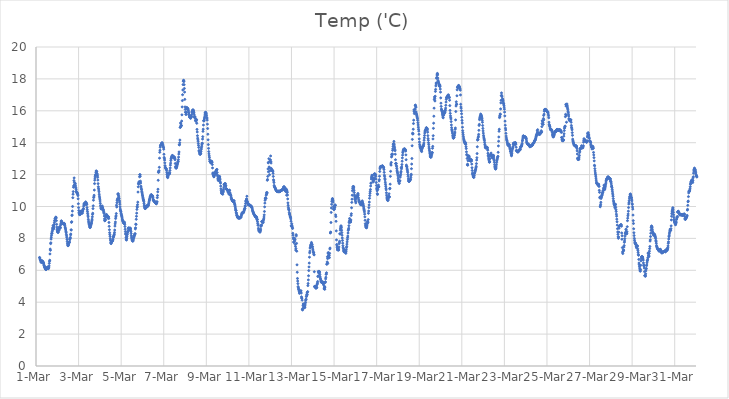
| Category | Temp ('C) |
|---|---|
| 44621.166666666664 | 6.807 |
| 44621.177083333336 | 6.78 |
| 44621.1875 | 6.709 |
| 44621.197916666664 | 6.65 |
| 44621.208333333336 | 6.647 |
| 44621.21875 | 6.585 |
| 44621.229166666664 | 6.597 |
| 44621.239583333336 | 6.498 |
| 44621.25 | 6.514 |
| 44621.260416666664 | 6.516 |
| 44621.270833333336 | 6.523 |
| 44621.28125 | 6.548 |
| 44621.291666666664 | 6.593 |
| 44621.302083333336 | 6.569 |
| 44621.3125 | 6.547 |
| 44621.322916666664 | 6.528 |
| 44621.333333333336 | 6.515 |
| 44621.34375 | 6.468 |
| 44621.354166666664 | 6.453 |
| 44621.364583333336 | 6.393 |
| 44621.375 | 6.325 |
| 44621.385416666664 | 6.295 |
| 44621.395833333336 | 6.237 |
| 44621.40625 | 6.186 |
| 44621.416666666664 | 6.149 |
| 44621.427083333336 | 6.165 |
| 44621.4375 | 6.115 |
| 44621.447916666664 | 6.073 |
| 44621.458333333336 | 6.053 |
| 44621.46875 | 6.049 |
| 44621.479166666664 | 6.056 |
| 44621.489583333336 | 6.08 |
| 44621.5 | 6.111 |
| 44621.510416666664 | 6.146 |
| 44621.520833333336 | 6.161 |
| 44621.53125 | 6.189 |
| 44621.541666666664 | 6.192 |
| 44621.552083333336 | 6.169 |
| 44621.5625 | 6.163 |
| 44621.572916666664 | 6.101 |
| 44621.583333333336 | 6.112 |
| 44621.59375 | 6.14 |
| 44621.604166666664 | 6.198 |
| 44621.614583333336 | 6.28 |
| 44621.625 | 6.437 |
| 44621.635416666664 | 6.565 |
| 44621.645833333336 | 6.632 |
| 44621.65625 | 7.025 |
| 44621.666666666664 | 7.33 |
| 44621.677083333336 | 7.256 |
| 44621.6875 | 7.672 |
| 44621.697916666664 | 7.723 |
| 44621.708333333336 | 7.956 |
| 44621.71875 | 8.076 |
| 44621.729166666664 | 8.202 |
| 44621.739583333336 | 8.321 |
| 44621.75 | 8.321 |
| 44621.760416666664 | 8.419 |
| 44621.770833333336 | 8.521 |
| 44621.78125 | 8.627 |
| 44621.791666666664 | 8.689 |
| 44621.802083333336 | 8.806 |
| 44621.8125 | 8.647 |
| 44621.822916666664 | 8.586 |
| 44621.833333333336 | 8.64 |
| 44621.84375 | 8.767 |
| 44621.854166666664 | 8.87 |
| 44621.864583333336 | 8.992 |
| 44621.875 | 9.104 |
| 44621.885416666664 | 9.142 |
| 44621.895833333336 | 9.23 |
| 44621.90625 | 9.242 |
| 44621.916666666664 | 9.272 |
| 44621.927083333336 | 9.323 |
| 44621.9375 | 9.332 |
| 44621.947916666664 | 9.275 |
| 44621.958333333336 | 9.113 |
| 44621.96875 | 8.882 |
| 44621.979166666664 | 8.705 |
| 44621.989583333336 | 8.572 |
| 44622.0 | 8.477 |
| 44622.010416666664 | 8.424 |
| 44622.020833333336 | 8.402 |
| 44622.03125 | 8.384 |
| 44622.041666666664 | 8.375 |
| 44622.052083333336 | 8.604 |
| 44622.0625 | 8.505 |
| 44622.072916666664 | 8.487 |
| 44622.083333333336 | 8.544 |
| 44622.09375 | 8.65 |
| 44622.104166666664 | 8.723 |
| 44622.114583333336 | 8.697 |
| 44622.125 | 8.65 |
| 44622.135416666664 | 8.646 |
| 44622.145833333336 | 8.691 |
| 44622.15625 | 8.838 |
| 44622.166666666664 | 8.916 |
| 44622.177083333336 | 9.032 |
| 44622.1875 | 9.097 |
| 44622.197916666664 | 9.084 |
| 44622.208333333336 | 9.008 |
| 44622.21875 | 8.981 |
| 44622.229166666664 | 8.961 |
| 44622.239583333336 | 8.956 |
| 44622.25 | 8.935 |
| 44622.260416666664 | 8.958 |
| 44622.270833333336 | 8.915 |
| 44622.28125 | 8.938 |
| 44622.291666666664 | 8.941 |
| 44622.302083333336 | 8.92 |
| 44622.3125 | 8.888 |
| 44622.322916666664 | 8.947 |
| 44622.333333333336 | 8.917 |
| 44622.34375 | 8.891 |
| 44622.354166666664 | 8.824 |
| 44622.364583333336 | 8.717 |
| 44622.375 | 8.661 |
| 44622.385416666664 | 8.6 |
| 44622.395833333336 | 8.526 |
| 44622.40625 | 8.432 |
| 44622.416666666664 | 8.358 |
| 44622.427083333336 | 8.247 |
| 44622.4375 | 8.158 |
| 44622.447916666664 | 8.06 |
| 44622.458333333336 | 7.93 |
| 44622.46875 | 7.797 |
| 44622.479166666664 | 7.685 |
| 44622.489583333336 | 7.602 |
| 44622.5 | 7.541 |
| 44622.510416666664 | 7.545 |
| 44622.520833333336 | 7.576 |
| 44622.53125 | 7.641 |
| 44622.541666666664 | 7.694 |
| 44622.552083333336 | 7.737 |
| 44622.5625 | 7.753 |
| 44622.572916666664 | 7.775 |
| 44622.583333333336 | 7.912 |
| 44622.59375 | 7.995 |
| 44622.604166666664 | 7.984 |
| 44622.614583333336 | 8.063 |
| 44622.625 | 8.224 |
| 44622.635416666664 | 8.275 |
| 44622.645833333336 | 8.535 |
| 44622.65625 | 8.528 |
| 44622.666666666664 | 9.005 |
| 44622.677083333336 | 9.045 |
| 44622.6875 | 9.436 |
| 44622.697916666664 | 9.468 |
| 44622.708333333336 | 9.714 |
| 44622.71875 | 10.002 |
| 44622.729166666664 | 10.552 |
| 44622.739583333336 | 10.769 |
| 44622.75 | 10.932 |
| 44622.760416666664 | 11.207 |
| 44622.770833333336 | 11.297 |
| 44622.78125 | 11.624 |
| 44622.791666666664 | 11.791 |
| 44622.802083333336 | 11.515 |
| 44622.8125 | 11.356 |
| 44622.822916666664 | 11.373 |
| 44622.833333333336 | 11.468 |
| 44622.84375 | 11.427 |
| 44622.854166666664 | 11.294 |
| 44622.864583333336 | 11.191 |
| 44622.875 | 11.154 |
| 44622.885416666664 | 11.063 |
| 44622.895833333336 | 10.95 |
| 44622.90625 | 10.895 |
| 44622.916666666664 | 10.859 |
| 44622.927083333336 | 10.867 |
| 44622.9375 | 10.849 |
| 44622.947916666664 | 10.802 |
| 44622.958333333336 | 10.758 |
| 44622.96875 | 10.684 |
| 44622.979166666664 | 10.482 |
| 44622.989583333336 | 10.172 |
| 44623.0 | 9.927 |
| 44623.010416666664 | 9.746 |
| 44623.020833333336 | 9.618 |
| 44623.03125 | 9.549 |
| 44623.041666666664 | 9.49 |
| 44623.052083333336 | 9.502 |
| 44623.0625 | 9.507 |
| 44623.072916666664 | 9.498 |
| 44623.083333333336 | 9.68 |
| 44623.09375 | 9.692 |
| 44623.104166666664 | 9.699 |
| 44623.114583333336 | 9.642 |
| 44623.125 | 9.564 |
| 44623.135416666664 | 9.684 |
| 44623.145833333336 | 9.726 |
| 44623.15625 | 9.618 |
| 44623.166666666664 | 9.646 |
| 44623.177083333336 | 9.575 |
| 44623.1875 | 9.722 |
| 44623.197916666664 | 9.716 |
| 44623.208333333336 | 9.808 |
| 44623.21875 | 9.845 |
| 44623.229166666664 | 9.876 |
| 44623.239583333336 | 10.022 |
| 44623.25 | 10.102 |
| 44623.260416666664 | 10.168 |
| 44623.270833333336 | 10.177 |
| 44623.28125 | 10.211 |
| 44623.291666666664 | 10.182 |
| 44623.302083333336 | 10.122 |
| 44623.3125 | 10.191 |
| 44623.322916666664 | 10.201 |
| 44623.333333333336 | 10.292 |
| 44623.34375 | 10.197 |
| 44623.354166666664 | 10.134 |
| 44623.364583333336 | 10.219 |
| 44623.375 | 10.197 |
| 44623.385416666664 | 10.121 |
| 44623.395833333336 | 9.934 |
| 44623.40625 | 9.805 |
| 44623.416666666664 | 9.688 |
| 44623.427083333336 | 9.569 |
| 44623.4375 | 9.461 |
| 44623.447916666664 | 9.357 |
| 44623.458333333336 | 9.198 |
| 44623.46875 | 9.084 |
| 44623.479166666664 | 8.989 |
| 44623.489583333336 | 8.919 |
| 44623.5 | 8.884 |
| 44623.510416666664 | 8.81 |
| 44623.520833333336 | 8.742 |
| 44623.53125 | 8.695 |
| 44623.541666666664 | 8.678 |
| 44623.552083333336 | 8.714 |
| 44623.5625 | 8.773 |
| 44623.572916666664 | 8.821 |
| 44623.583333333336 | 8.882 |
| 44623.59375 | 8.92 |
| 44623.604166666664 | 8.96 |
| 44623.614583333336 | 9.039 |
| 44623.625 | 9.126 |
| 44623.635416666664 | 9.205 |
| 44623.645833333336 | 9.351 |
| 44623.65625 | 9.504 |
| 44623.666666666664 | 9.578 |
| 44623.677083333336 | 9.868 |
| 44623.6875 | 10.043 |
| 44623.697916666664 | 10.396 |
| 44623.708333333336 | 10.561 |
| 44623.71875 | 10.604 |
| 44623.729166666664 | 10.705 |
| 44623.739583333336 | 11.03 |
| 44623.75 | 11.435 |
| 44623.760416666664 | 11.65 |
| 44623.770833333336 | 11.777 |
| 44623.78125 | 11.89 |
| 44623.791666666664 | 11.964 |
| 44623.802083333336 | 11.986 |
| 44623.8125 | 12.113 |
| 44623.822916666664 | 12.224 |
| 44623.833333333336 | 12.222 |
| 44623.84375 | 12.194 |
| 44623.854166666664 | 12.179 |
| 44623.864583333336 | 12.062 |
| 44623.875 | 12.022 |
| 44623.885416666664 | 11.926 |
| 44623.895833333336 | 11.831 |
| 44623.90625 | 11.659 |
| 44623.916666666664 | 11.433 |
| 44623.927083333336 | 11.241 |
| 44623.9375 | 11.135 |
| 44623.947916666664 | 11.034 |
| 44623.958333333336 | 10.923 |
| 44623.96875 | 10.772 |
| 44623.979166666664 | 10.648 |
| 44623.989583333336 | 10.543 |
| 44624.0 | 10.458 |
| 44624.010416666664 | 10.343 |
| 44624.020833333336 | 10.199 |
| 44624.03125 | 10.064 |
| 44624.041666666664 | 9.973 |
| 44624.052083333336 | 9.885 |
| 44624.0625 | 9.847 |
| 44624.072916666664 | 9.85 |
| 44624.083333333336 | 9.875 |
| 44624.09375 | 9.927 |
| 44624.104166666664 | 9.961 |
| 44624.114583333336 | 10.03 |
| 44624.125 | 9.939 |
| 44624.135416666664 | 9.901 |
| 44624.145833333336 | 9.834 |
| 44624.15625 | 9.798 |
| 44624.166666666664 | 9.762 |
| 44624.177083333336 | 9.677 |
| 44624.1875 | 9.617 |
| 44624.197916666664 | 9.559 |
| 44624.208333333336 | 9.4 |
| 44624.21875 | 9.224 |
| 44624.229166666664 | 9.107 |
| 44624.239583333336 | 9.124 |
| 44624.25 | 9.153 |
| 44624.260416666664 | 9.183 |
| 44624.270833333336 | 9.347 |
| 44624.28125 | 9.469 |
| 44624.291666666664 | 9.38 |
| 44624.302083333336 | 9.458 |
| 44624.3125 | 9.5 |
| 44624.322916666664 | 9.43 |
| 44624.333333333336 | 9.457 |
| 44624.34375 | 9.338 |
| 44624.354166666664 | 9.363 |
| 44624.364583333336 | 9.381 |
| 44624.375 | 9.272 |
| 44624.385416666664 | 9.323 |
| 44624.395833333336 | 9.35 |
| 44624.40625 | 9.355 |
| 44624.416666666664 | 9.248 |
| 44624.427083333336 | 8.999 |
| 44624.4375 | 8.757 |
| 44624.447916666664 | 8.543 |
| 44624.458333333336 | 8.358 |
| 44624.46875 | 8.236 |
| 44624.479166666664 | 8.121 |
| 44624.489583333336 | 7.974 |
| 44624.5 | 7.873 |
| 44624.510416666664 | 7.753 |
| 44624.520833333336 | 7.684 |
| 44624.53125 | 7.678 |
| 44624.541666666664 | 7.765 |
| 44624.552083333336 | 7.791 |
| 44624.5625 | 7.798 |
| 44624.572916666664 | 7.811 |
| 44624.583333333336 | 7.826 |
| 44624.59375 | 7.858 |
| 44624.604166666664 | 7.889 |
| 44624.614583333336 | 7.944 |
| 44624.625 | 8.091 |
| 44624.635416666664 | 8.061 |
| 44624.645833333336 | 8.132 |
| 44624.65625 | 8.171 |
| 44624.666666666664 | 8.223 |
| 44624.677083333336 | 8.272 |
| 44624.6875 | 8.376 |
| 44624.697916666664 | 8.523 |
| 44624.708333333336 | 8.773 |
| 44624.71875 | 8.91 |
| 44624.729166666664 | 9.027 |
| 44624.739583333336 | 9.246 |
| 44624.75 | 9.349 |
| 44624.760416666664 | 9.415 |
| 44624.770833333336 | 9.556 |
| 44624.78125 | 10.083 |
| 44624.791666666664 | 9.97 |
| 44624.802083333336 | 10.237 |
| 44624.8125 | 10.374 |
| 44624.822916666664 | 10.433 |
| 44624.833333333336 | 10.499 |
| 44624.84375 | 10.776 |
| 44624.854166666664 | 10.784 |
| 44624.864583333336 | 10.795 |
| 44624.875 | 10.699 |
| 44624.885416666664 | 10.623 |
| 44624.895833333336 | 10.531 |
| 44624.90625 | 10.483 |
| 44624.916666666664 | 10.368 |
| 44624.927083333336 | 10.278 |
| 44624.9375 | 10.143 |
| 44624.947916666664 | 9.983 |
| 44624.958333333336 | 9.837 |
| 44624.96875 | 9.759 |
| 44624.979166666664 | 9.702 |
| 44624.989583333336 | 9.659 |
| 44625.0 | 9.558 |
| 44625.010416666664 | 9.494 |
| 44625.020833333336 | 9.432 |
| 44625.03125 | 9.384 |
| 44625.041666666664 | 9.292 |
| 44625.052083333336 | 9.21 |
| 44625.0625 | 9.149 |
| 44625.072916666664 | 9.105 |
| 44625.083333333336 | 9.074 |
| 44625.09375 | 9.041 |
| 44625.104166666664 | 8.995 |
| 44625.114583333336 | 8.977 |
| 44625.125 | 8.952 |
| 44625.135416666664 | 8.947 |
| 44625.145833333336 | 8.961 |
| 44625.15625 | 9.018 |
| 44625.166666666664 | 8.883 |
| 44625.177083333336 | 8.744 |
| 44625.1875 | 8.573 |
| 44625.197916666664 | 8.425 |
| 44625.208333333336 | 8.29 |
| 44625.21875 | 8.245 |
| 44625.229166666664 | 8.066 |
| 44625.239583333336 | 7.928 |
| 44625.25 | 7.895 |
| 44625.260416666664 | 7.997 |
| 44625.270833333336 | 8.11 |
| 44625.28125 | 8.226 |
| 44625.291666666664 | 8.279 |
| 44625.302083333336 | 8.386 |
| 44625.3125 | 8.417 |
| 44625.322916666664 | 8.484 |
| 44625.333333333336 | 8.62 |
| 44625.34375 | 8.661 |
| 44625.354166666664 | 8.632 |
| 44625.364583333336 | 8.599 |
| 44625.375 | 8.647 |
| 44625.385416666664 | 8.633 |
| 44625.395833333336 | 8.623 |
| 44625.40625 | 8.529 |
| 44625.416666666664 | 8.625 |
| 44625.427083333336 | 8.648 |
| 44625.4375 | 8.62 |
| 44625.447916666664 | 8.52 |
| 44625.458333333336 | 8.42 |
| 44625.46875 | 8.303 |
| 44625.479166666664 | 8.17 |
| 44625.489583333336 | 8.076 |
| 44625.5 | 7.997 |
| 44625.510416666664 | 7.927 |
| 44625.520833333336 | 7.88 |
| 44625.53125 | 7.854 |
| 44625.541666666664 | 7.834 |
| 44625.552083333336 | 7.829 |
| 44625.5625 | 7.862 |
| 44625.572916666664 | 7.946 |
| 44625.583333333336 | 8.014 |
| 44625.59375 | 8.059 |
| 44625.604166666664 | 8.112 |
| 44625.614583333336 | 8.158 |
| 44625.625 | 8.198 |
| 44625.635416666664 | 8.256 |
| 44625.645833333336 | 8.276 |
| 44625.65625 | 8.299 |
| 44625.666666666664 | 8.595 |
| 44625.677083333336 | 8.665 |
| 44625.6875 | 8.894 |
| 44625.697916666664 | 8.877 |
| 44625.708333333336 | 9.197 |
| 44625.71875 | 9.387 |
| 44625.729166666664 | 9.583 |
| 44625.739583333336 | 9.818 |
| 44625.75 | 10.002 |
| 44625.760416666664 | 9.953 |
| 44625.770833333336 | 10.116 |
| 44625.78125 | 10.274 |
| 44625.791666666664 | 10.906 |
| 44625.802083333336 | 11.233 |
| 44625.8125 | 11.442 |
| 44625.822916666664 | 11.4 |
| 44625.833333333336 | 11.503 |
| 44625.84375 | 11.558 |
| 44625.854166666664 | 11.522 |
| 44625.864583333336 | 11.861 |
| 44625.875 | 11.993 |
| 44625.885416666664 | 11.998 |
| 44625.895833333336 | 11.899 |
| 44625.90625 | 11.587 |
| 44625.916666666664 | 11.472 |
| 44625.927083333336 | 11.28 |
| 44625.9375 | 11.215 |
| 44625.947916666664 | 11.109 |
| 44625.958333333336 | 11.054 |
| 44625.96875 | 10.946 |
| 44625.979166666664 | 10.869 |
| 44625.989583333336 | 10.788 |
| 44626.0 | 10.713 |
| 44626.010416666664 | 10.65 |
| 44626.020833333336 | 10.563 |
| 44626.03125 | 10.491 |
| 44626.041666666664 | 10.427 |
| 44626.052083333336 | 10.388 |
| 44626.0625 | 10.322 |
| 44626.072916666664 | 10.201 |
| 44626.083333333336 | 10.088 |
| 44626.09375 | 10.01 |
| 44626.104166666664 | 9.945 |
| 44626.114583333336 | 9.904 |
| 44626.125 | 9.871 |
| 44626.135416666664 | 9.879 |
| 44626.145833333336 | 9.892 |
| 44626.15625 | 9.914 |
| 44626.166666666664 | 9.92 |
| 44626.177083333336 | 9.941 |
| 44626.1875 | 10.028 |
| 44626.197916666664 | 10.044 |
| 44626.208333333336 | 10.026 |
| 44626.21875 | 9.993 |
| 44626.229166666664 | 9.996 |
| 44626.239583333336 | 10.031 |
| 44626.25 | 10.03 |
| 44626.260416666664 | 10.03 |
| 44626.270833333336 | 10.066 |
| 44626.28125 | 10.091 |
| 44626.291666666664 | 10.171 |
| 44626.302083333336 | 10.231 |
| 44626.3125 | 10.33 |
| 44626.322916666664 | 10.405 |
| 44626.333333333336 | 10.413 |
| 44626.34375 | 10.499 |
| 44626.354166666664 | 10.545 |
| 44626.364583333336 | 10.609 |
| 44626.375 | 10.617 |
| 44626.385416666664 | 10.678 |
| 44626.395833333336 | 10.709 |
| 44626.40625 | 10.734 |
| 44626.416666666664 | 10.731 |
| 44626.427083333336 | 10.731 |
| 44626.4375 | 10.696 |
| 44626.447916666664 | 10.696 |
| 44626.458333333336 | 10.683 |
| 44626.46875 | 10.657 |
| 44626.479166666664 | 10.624 |
| 44626.489583333336 | 10.565 |
| 44626.5 | 10.466 |
| 44626.510416666664 | 10.391 |
| 44626.520833333336 | 10.379 |
| 44626.53125 | 10.378 |
| 44626.541666666664 | 10.348 |
| 44626.552083333336 | 10.321 |
| 44626.5625 | 10.314 |
| 44626.572916666664 | 10.291 |
| 44626.583333333336 | 10.277 |
| 44626.59375 | 10.268 |
| 44626.604166666664 | 10.262 |
| 44626.614583333336 | 10.242 |
| 44626.625 | 10.216 |
| 44626.635416666664 | 10.192 |
| 44626.645833333336 | 10.171 |
| 44626.65625 | 10.176 |
| 44626.666666666664 | 10.205 |
| 44626.677083333336 | 10.301 |
| 44626.6875 | 10.284 |
| 44626.697916666664 | 10.553 |
| 44626.708333333336 | 10.689 |
| 44626.71875 | 10.918 |
| 44626.729166666664 | 11.084 |
| 44626.739583333336 | 11.644 |
| 44626.75 | 12.141 |
| 44626.760416666664 | 12.205 |
| 44626.770833333336 | 12.153 |
| 44626.78125 | 12.245 |
| 44626.791666666664 | 12.456 |
| 44626.802083333336 | 13.031 |
| 44626.8125 | 13.397 |
| 44626.822916666664 | 13.529 |
| 44626.833333333336 | 13.716 |
| 44626.84375 | 13.804 |
| 44626.854166666664 | 13.841 |
| 44626.864583333336 | 13.84 |
| 44626.875 | 13.875 |
| 44626.885416666664 | 13.9 |
| 44626.895833333336 | 13.947 |
| 44626.90625 | 13.972 |
| 44626.916666666664 | 13.986 |
| 44626.927083333336 | 13.997 |
| 44626.9375 | 13.929 |
| 44626.947916666664 | 13.88 |
| 44626.958333333336 | 13.855 |
| 44626.96875 | 13.797 |
| 44626.979166666664 | 13.732 |
| 44626.989583333336 | 13.696 |
| 44627.0 | 13.594 |
| 44627.010416666664 | 13.274 |
| 44627.020833333336 | 13.076 |
| 44627.03125 | 13.003 |
| 44627.041666666664 | 12.91 |
| 44627.052083333336 | 12.735 |
| 44627.0625 | 12.563 |
| 44627.072916666664 | 12.467 |
| 44627.083333333336 | 12.43 |
| 44627.09375 | 12.397 |
| 44627.104166666664 | 12.355 |
| 44627.114583333336 | 12.365 |
| 44627.125 | 12.337 |
| 44627.135416666664 | 12.247 |
| 44627.145833333336 | 12.119 |
| 44627.15625 | 12.005 |
| 44627.166666666664 | 11.901 |
| 44627.177083333336 | 11.845 |
| 44627.1875 | 11.808 |
| 44627.197916666664 | 11.87 |
| 44627.208333333336 | 12.009 |
| 44627.21875 | 12.005 |
| 44627.229166666664 | 12.11 |
| 44627.239583333336 | 12.077 |
| 44627.25 | 12.082 |
| 44627.260416666664 | 12.025 |
| 44627.270833333336 | 12.062 |
| 44627.28125 | 12.117 |
| 44627.291666666664 | 12.26 |
| 44627.302083333336 | 12.419 |
| 44627.3125 | 12.595 |
| 44627.322916666664 | 12.721 |
| 44627.333333333336 | 12.882 |
| 44627.34375 | 12.982 |
| 44627.354166666664 | 13.025 |
| 44627.364583333336 | 13.088 |
| 44627.375 | 13.104 |
| 44627.385416666664 | 13.151 |
| 44627.395833333336 | 13.177 |
| 44627.40625 | 13.201 |
| 44627.416666666664 | 13.188 |
| 44627.427083333336 | 13.158 |
| 44627.4375 | 13.144 |
| 44627.447916666664 | 13.126 |
| 44627.458333333336 | 13.103 |
| 44627.46875 | 13.048 |
| 44627.479166666664 | 13.093 |
| 44627.489583333336 | 13.109 |
| 44627.5 | 13.092 |
| 44627.510416666664 | 13.058 |
| 44627.520833333336 | 13.012 |
| 44627.53125 | 12.928 |
| 44627.541666666664 | 12.695 |
| 44627.552083333336 | 12.503 |
| 44627.5625 | 12.442 |
| 44627.572916666664 | 12.41 |
| 44627.583333333336 | 12.413 |
| 44627.59375 | 12.418 |
| 44627.604166666664 | 12.472 |
| 44627.614583333336 | 12.518 |
| 44627.625 | 12.584 |
| 44627.635416666664 | 12.638 |
| 44627.645833333336 | 12.691 |
| 44627.65625 | 12.752 |
| 44627.666666666664 | 12.807 |
| 44627.677083333336 | 12.836 |
| 44627.6875 | 12.941 |
| 44627.697916666664 | 13.098 |
| 44627.708333333336 | 13.288 |
| 44627.71875 | 13.419 |
| 44627.729166666664 | 13.872 |
| 44627.739583333336 | 13.871 |
| 44627.75 | 13.994 |
| 44627.760416666664 | 14.166 |
| 44627.770833333336 | 14.962 |
| 44627.78125 | 14.964 |
| 44627.791666666664 | 15.243 |
| 44627.802083333336 | 15.185 |
| 44627.8125 | 15.073 |
| 44627.822916666664 | 15.059 |
| 44627.833333333336 | 15.079 |
| 44627.84375 | 15.356 |
| 44627.854166666664 | 15.748 |
| 44627.864583333336 | 16.242 |
| 44627.875 | 16.64 |
| 44627.885416666664 | 17.007 |
| 44627.895833333336 | 17.305 |
| 44627.90625 | 17.643 |
| 44627.916666666664 | 17.856 |
| 44627.927083333336 | 17.91 |
| 44627.9375 | 17.902 |
| 44627.947916666664 | 17.834 |
| 44627.958333333336 | 17.637 |
| 44627.96875 | 17.4 |
| 44627.979166666664 | 17.173 |
| 44627.989583333336 | 16.716 |
| 44628.0 | 16.243 |
| 44628.010416666664 | 16.088 |
| 44628.020833333336 | 15.916 |
| 44628.03125 | 15.894 |
| 44628.041666666664 | 15.776 |
| 44628.052083333336 | 15.776 |
| 44628.0625 | 15.914 |
| 44628.072916666664 | 16.169 |
| 44628.083333333336 | 16.215 |
| 44628.09375 | 16.12 |
| 44628.104166666664 | 16.12 |
| 44628.114583333336 | 16.143 |
| 44628.125 | 16.159 |
| 44628.135416666664 | 16.126 |
| 44628.145833333336 | 16.079 |
| 44628.15625 | 16.012 |
| 44628.166666666664 | 15.917 |
| 44628.177083333336 | 15.859 |
| 44628.1875 | 15.778 |
| 44628.197916666664 | 15.698 |
| 44628.208333333336 | 15.615 |
| 44628.21875 | 15.592 |
| 44628.229166666664 | 15.682 |
| 44628.239583333336 | 15.636 |
| 44628.25 | 15.575 |
| 44628.260416666664 | 15.526 |
| 44628.270833333336 | 15.603 |
| 44628.28125 | 15.623 |
| 44628.291666666664 | 15.632 |
| 44628.302083333336 | 15.617 |
| 44628.3125 | 15.751 |
| 44628.322916666664 | 15.937 |
| 44628.333333333336 | 15.884 |
| 44628.34375 | 15.93 |
| 44628.354166666664 | 16.048 |
| 44628.364583333336 | 16.025 |
| 44628.375 | 16.047 |
| 44628.385416666664 | 16.052 |
| 44628.395833333336 | 15.925 |
| 44628.40625 | 15.98 |
| 44628.416666666664 | 15.884 |
| 44628.427083333336 | 15.776 |
| 44628.4375 | 15.649 |
| 44628.447916666664 | 15.587 |
| 44628.458333333336 | 15.59 |
| 44628.46875 | 15.626 |
| 44628.479166666664 | 15.528 |
| 44628.489583333336 | 15.403 |
| 44628.5 | 15.391 |
| 44628.510416666664 | 15.338 |
| 44628.520833333336 | 15.392 |
| 44628.53125 | 15.424 |
| 44628.541666666664 | 15.449 |
| 44628.552083333336 | 15.217 |
| 44628.5625 | 14.835 |
| 44628.572916666664 | 14.673 |
| 44628.583333333336 | 14.44 |
| 44628.59375 | 14.283 |
| 44628.604166666664 | 14.18 |
| 44628.614583333336 | 14.089 |
| 44628.625 | 13.948 |
| 44628.635416666664 | 13.829 |
| 44628.645833333336 | 13.7 |
| 44628.65625 | 13.508 |
| 44628.666666666664 | 13.447 |
| 44628.677083333336 | 13.413 |
| 44628.6875 | 13.324 |
| 44628.697916666664 | 13.284 |
| 44628.708333333336 | 13.277 |
| 44628.71875 | 13.275 |
| 44628.729166666664 | 13.318 |
| 44628.739583333336 | 13.34 |
| 44628.75 | 13.462 |
| 44628.760416666664 | 13.588 |
| 44628.770833333336 | 13.677 |
| 44628.78125 | 13.767 |
| 44628.791666666664 | 13.871 |
| 44628.802083333336 | 13.96 |
| 44628.8125 | 13.968 |
| 44628.822916666664 | 14.227 |
| 44628.833333333336 | 14.379 |
| 44628.84375 | 14.711 |
| 44628.854166666664 | 14.848 |
| 44628.864583333336 | 15.106 |
| 44628.875 | 15.386 |
| 44628.885416666664 | 15.356 |
| 44628.895833333336 | 15.399 |
| 44628.90625 | 15.483 |
| 44628.916666666664 | 15.564 |
| 44628.927083333336 | 15.666 |
| 44628.9375 | 15.792 |
| 44628.947916666664 | 15.881 |
| 44628.958333333336 | 15.905 |
| 44628.96875 | 15.869 |
| 44628.979166666664 | 15.893 |
| 44628.989583333336 | 15.844 |
| 44629.0 | 15.791 |
| 44629.010416666664 | 15.691 |
| 44629.020833333336 | 15.571 |
| 44629.03125 | 15.536 |
| 44629.041666666664 | 15.417 |
| 44629.052083333336 | 15.162 |
| 44629.0625 | 14.889 |
| 44629.072916666664 | 14.532 |
| 44629.083333333336 | 14.18 |
| 44629.09375 | 13.882 |
| 44629.104166666664 | 13.644 |
| 44629.114583333336 | 13.442 |
| 44629.125 | 13.3 |
| 44629.135416666664 | 13.173 |
| 44629.145833333336 | 13.067 |
| 44629.15625 | 12.936 |
| 44629.166666666664 | 12.831 |
| 44629.177083333336 | 12.831 |
| 44629.1875 | 12.794 |
| 44629.197916666664 | 12.762 |
| 44629.208333333336 | 12.74 |
| 44629.21875 | 12.746 |
| 44629.229166666664 | 12.764 |
| 44629.239583333336 | 12.826 |
| 44629.25 | 12.838 |
| 44629.260416666664 | 12.767 |
| 44629.270833333336 | 12.786 |
| 44629.28125 | 12.629 |
| 44629.291666666664 | 12.417 |
| 44629.302083333336 | 12.088 |
| 44629.3125 | 11.991 |
| 44629.322916666664 | 12.107 |
| 44629.333333333336 | 11.993 |
| 44629.34375 | 11.916 |
| 44629.354166666664 | 11.86 |
| 44629.364583333336 | 11.874 |
| 44629.375 | 11.956 |
| 44629.385416666664 | 11.985 |
| 44629.395833333336 | 12.027 |
| 44629.40625 | 12.102 |
| 44629.416666666664 | 12.114 |
| 44629.427083333336 | 12.194 |
| 44629.4375 | 12.088 |
| 44629.447916666664 | 12.053 |
| 44629.458333333336 | 12.223 |
| 44629.46875 | 12.289 |
| 44629.479166666664 | 12.274 |
| 44629.489583333336 | 12.295 |
| 44629.5 | 12.327 |
| 44629.510416666664 | 12.129 |
| 44629.520833333336 | 11.975 |
| 44629.53125 | 11.91 |
| 44629.541666666664 | 11.775 |
| 44629.552083333336 | 11.704 |
| 44629.5625 | 11.637 |
| 44629.572916666664 | 11.624 |
| 44629.583333333336 | 11.75 |
| 44629.59375 | 11.795 |
| 44629.604166666664 | 11.832 |
| 44629.614583333336 | 11.869 |
| 44629.625 | 11.885 |
| 44629.635416666664 | 11.772 |
| 44629.645833333336 | 11.674 |
| 44629.65625 | 11.537 |
| 44629.666666666664 | 11.466 |
| 44629.677083333336 | 11.28 |
| 44629.6875 | 11.107 |
| 44629.697916666664 | 10.989 |
| 44629.708333333336 | 10.904 |
| 44629.71875 | 10.826 |
| 44629.729166666664 | 10.816 |
| 44629.739583333336 | 10.809 |
| 44629.75 | 10.872 |
| 44629.760416666664 | 10.831 |
| 44629.770833333336 | 10.768 |
| 44629.78125 | 10.97 |
| 44629.791666666664 | 11 |
| 44629.802083333336 | 10.914 |
| 44629.8125 | 11.083 |
| 44629.822916666664 | 11.211 |
| 44629.833333333336 | 11.361 |
| 44629.84375 | 11.383 |
| 44629.854166666664 | 11.411 |
| 44629.864583333336 | 11.415 |
| 44629.875 | 11.425 |
| 44629.885416666664 | 11.391 |
| 44629.895833333336 | 11.439 |
| 44629.90625 | 11.272 |
| 44629.916666666664 | 11.304 |
| 44629.927083333336 | 11.12 |
| 44629.9375 | 11.118 |
| 44629.947916666664 | 11.1 |
| 44629.958333333336 | 11.076 |
| 44629.96875 | 11.078 |
| 44629.979166666664 | 11.028 |
| 44629.989583333336 | 11.029 |
| 44630.0 | 11.024 |
| 44630.010416666664 | 10.977 |
| 44630.020833333336 | 10.9 |
| 44630.03125 | 10.938 |
| 44630.041666666664 | 10.877 |
| 44630.052083333336 | 10.854 |
| 44630.0625 | 10.773 |
| 44630.072916666664 | 11.008 |
| 44630.083333333336 | 11.026 |
| 44630.09375 | 11.005 |
| 44630.104166666664 | 10.872 |
| 44630.114583333336 | 10.818 |
| 44630.125 | 10.756 |
| 44630.135416666664 | 10.73 |
| 44630.145833333336 | 10.706 |
| 44630.15625 | 10.66 |
| 44630.166666666664 | 10.58 |
| 44630.177083333336 | 10.511 |
| 44630.1875 | 10.463 |
| 44630.197916666664 | 10.439 |
| 44630.208333333336 | 10.411 |
| 44630.21875 | 10.379 |
| 44630.229166666664 | 10.354 |
| 44630.239583333336 | 10.341 |
| 44630.25 | 10.33 |
| 44630.260416666664 | 10.31 |
| 44630.270833333336 | 10.318 |
| 44630.28125 | 10.332 |
| 44630.291666666664 | 10.368 |
| 44630.302083333336 | 10.358 |
| 44630.3125 | 10.275 |
| 44630.322916666664 | 10.195 |
| 44630.333333333336 | 10.136 |
| 44630.34375 | 10.084 |
| 44630.354166666664 | 10.007 |
| 44630.364583333336 | 9.909 |
| 44630.375 | 9.828 |
| 44630.385416666664 | 9.74 |
| 44630.395833333336 | 9.752 |
| 44630.40625 | 9.616 |
| 44630.416666666664 | 9.573 |
| 44630.427083333336 | 9.476 |
| 44630.4375 | 9.427 |
| 44630.447916666664 | 9.431 |
| 44630.458333333336 | 9.376 |
| 44630.46875 | 9.325 |
| 44630.479166666664 | 9.318 |
| 44630.489583333336 | 9.276 |
| 44630.5 | 9.29 |
| 44630.510416666664 | 9.307 |
| 44630.520833333336 | 9.283 |
| 44630.53125 | 9.267 |
| 44630.541666666664 | 9.303 |
| 44630.552083333336 | 9.299 |
| 44630.5625 | 9.281 |
| 44630.572916666664 | 9.273 |
| 44630.583333333336 | 9.278 |
| 44630.59375 | 9.304 |
| 44630.604166666664 | 9.319 |
| 44630.614583333336 | 9.33 |
| 44630.625 | 9.333 |
| 44630.635416666664 | 9.354 |
| 44630.645833333336 | 9.434 |
| 44630.65625 | 9.489 |
| 44630.666666666664 | 9.537 |
| 44630.677083333336 | 9.574 |
| 44630.6875 | 9.612 |
| 44630.697916666664 | 9.616 |
| 44630.708333333336 | 9.594 |
| 44630.71875 | 9.603 |
| 44630.729166666664 | 9.603 |
| 44630.739583333336 | 9.617 |
| 44630.75 | 9.644 |
| 44630.760416666664 | 9.663 |
| 44630.770833333336 | 9.725 |
| 44630.78125 | 9.782 |
| 44630.791666666664 | 9.813 |
| 44630.802083333336 | 9.889 |
| 44630.8125 | 9.882 |
| 44630.822916666664 | 10.038 |
| 44630.833333333336 | 10.019 |
| 44630.84375 | 10.189 |
| 44630.854166666664 | 10.317 |
| 44630.864583333336 | 10.369 |
| 44630.875 | 10.391 |
| 44630.885416666664 | 10.467 |
| 44630.895833333336 | 10.46 |
| 44630.90625 | 10.643 |
| 44630.916666666664 | 10.332 |
| 44630.927083333336 | 10.315 |
| 44630.9375 | 10.259 |
| 44630.947916666664 | 10.204 |
| 44630.958333333336 | 10.146 |
| 44630.96875 | 10.124 |
| 44630.979166666664 | 10.113 |
| 44630.989583333336 | 10.131 |
| 44631.0 | 10.106 |
| 44631.010416666664 | 10.088 |
| 44631.020833333336 | 10.093 |
| 44631.03125 | 10.081 |
| 44631.041666666664 | 10.085 |
| 44631.052083333336 | 10.085 |
| 44631.0625 | 10.068 |
| 44631.072916666664 | 10.052 |
| 44631.083333333336 | 10.055 |
| 44631.09375 | 9.996 |
| 44631.104166666664 | 9.986 |
| 44631.114583333336 | 10.008 |
| 44631.125 | 9.997 |
| 44631.135416666664 | 9.961 |
| 44631.145833333336 | 9.923 |
| 44631.15625 | 9.855 |
| 44631.166666666664 | 9.775 |
| 44631.177083333336 | 9.725 |
| 44631.1875 | 9.689 |
| 44631.197916666664 | 9.653 |
| 44631.208333333336 | 9.615 |
| 44631.21875 | 9.579 |
| 44631.229166666664 | 9.538 |
| 44631.239583333336 | 9.507 |
| 44631.25 | 9.48 |
| 44631.260416666664 | 9.46 |
| 44631.270833333336 | 9.442 |
| 44631.28125 | 9.428 |
| 44631.291666666664 | 9.38 |
| 44631.302083333336 | 9.36 |
| 44631.3125 | 9.343 |
| 44631.322916666664 | 9.346 |
| 44631.333333333336 | 9.345 |
| 44631.34375 | 9.37 |
| 44631.354166666664 | 9.296 |
| 44631.364583333336 | 9.322 |
| 44631.375 | 9.21 |
| 44631.385416666664 | 9.161 |
| 44631.395833333336 | 9.192 |
| 44631.40625 | 9.045 |
| 44631.416666666664 | 8.925 |
| 44631.427083333336 | 8.824 |
| 44631.4375 | 8.836 |
| 44631.447916666664 | 8.636 |
| 44631.458333333336 | 8.545 |
| 44631.46875 | 8.476 |
| 44631.479166666664 | 8.458 |
| 44631.489583333336 | 8.479 |
| 44631.5 | 8.443 |
| 44631.510416666664 | 8.463 |
| 44631.520833333336 | 8.387 |
| 44631.53125 | 8.468 |
| 44631.541666666664 | 8.477 |
| 44631.552083333336 | 8.58 |
| 44631.5625 | 8.753 |
| 44631.572916666664 | 8.788 |
| 44631.583333333336 | 8.803 |
| 44631.59375 | 8.851 |
| 44631.604166666664 | 9.046 |
| 44631.614583333336 | 9.077 |
| 44631.625 | 9.054 |
| 44631.635416666664 | 9.052 |
| 44631.645833333336 | 9.037 |
| 44631.65625 | 9.01 |
| 44631.666666666664 | 8.99 |
| 44631.677083333336 | 9.094 |
| 44631.6875 | 9.17 |
| 44631.697916666664 | 9.227 |
| 44631.708333333336 | 9.342 |
| 44631.71875 | 9.474 |
| 44631.729166666664 | 9.689 |
| 44631.739583333336 | 9.978 |
| 44631.75 | 10.213 |
| 44631.760416666664 | 10.391 |
| 44631.770833333336 | 10.493 |
| 44631.78125 | 10.548 |
| 44631.791666666664 | 10.506 |
| 44631.802083333336 | 10.515 |
| 44631.8125 | 10.709 |
| 44631.822916666664 | 10.766 |
| 44631.833333333336 | 10.878 |
| 44631.84375 | 10.82 |
| 44631.854166666664 | 10.87 |
| 44631.864583333336 | 11.646 |
| 44631.875 | 11.694 |
| 44631.885416666664 | 11.889 |
| 44631.895833333336 | 12.355 |
| 44631.90625 | 12.737 |
| 44631.916666666664 | 12.175 |
| 44631.927083333336 | 12.777 |
| 44631.9375 | 12.996 |
| 44631.947916666664 | 12.477 |
| 44631.958333333336 | 12.415 |
| 44631.96875 | 11.993 |
| 44631.979166666664 | 12.229 |
| 44631.989583333336 | 12.412 |
| 44632.0 | 12.843 |
| 44632.010416666664 | 12.928 |
| 44632.020833333336 | 13.167 |
| 44632.03125 | 12.814 |
| 44632.041666666664 | 12.725 |
| 44632.052083333336 | 12.388 |
| 44632.0625 | 12.334 |
| 44632.072916666664 | 12.28 |
| 44632.083333333336 | 12.28 |
| 44632.09375 | 12.247 |
| 44632.104166666664 | 12.23 |
| 44632.114583333336 | 12.26 |
| 44632.125 | 12.201 |
| 44632.135416666664 | 12.078 |
| 44632.145833333336 | 11.887 |
| 44632.15625 | 11.677 |
| 44632.166666666664 | 11.604 |
| 44632.177083333336 | 11.501 |
| 44632.1875 | 11.321 |
| 44632.197916666664 | 11.247 |
| 44632.208333333336 | 11.221 |
| 44632.21875 | 11.217 |
| 44632.229166666664 | 11.17 |
| 44632.239583333336 | 11.148 |
| 44632.25 | 11.101 |
| 44632.260416666664 | 11.062 |
| 44632.270833333336 | 11.043 |
| 44632.28125 | 11.008 |
| 44632.291666666664 | 10.993 |
| 44632.302083333336 | 10.977 |
| 44632.3125 | 10.963 |
| 44632.322916666664 | 10.951 |
| 44632.333333333336 | 10.941 |
| 44632.34375 | 10.938 |
| 44632.354166666664 | 10.935 |
| 44632.364583333336 | 10.929 |
| 44632.375 | 10.929 |
| 44632.385416666664 | 10.927 |
| 44632.395833333336 | 10.967 |
| 44632.40625 | 10.95 |
| 44632.416666666664 | 10.964 |
| 44632.427083333336 | 10.946 |
| 44632.4375 | 10.928 |
| 44632.447916666664 | 10.967 |
| 44632.458333333336 | 10.944 |
| 44632.46875 | 10.953 |
| 44632.479166666664 | 10.972 |
| 44632.489583333336 | 10.984 |
| 44632.5 | 10.998 |
| 44632.510416666664 | 11.015 |
| 44632.520833333336 | 10.997 |
| 44632.53125 | 11.011 |
| 44632.541666666664 | 11.025 |
| 44632.552083333336 | 11.039 |
| 44632.5625 | 11.043 |
| 44632.572916666664 | 11.055 |
| 44632.583333333336 | 11.064 |
| 44632.59375 | 11.055 |
| 44632.604166666664 | 11.111 |
| 44632.614583333336 | 11.095 |
| 44632.625 | 11.215 |
| 44632.635416666664 | 11.167 |
| 44632.645833333336 | 11.244 |
| 44632.65625 | 11.221 |
| 44632.666666666664 | 11.208 |
| 44632.677083333336 | 11.108 |
| 44632.6875 | 11.088 |
| 44632.697916666664 | 11.12 |
| 44632.708333333336 | 10.969 |
| 44632.71875 | 10.998 |
| 44632.729166666664 | 11.117 |
| 44632.739583333336 | 11.059 |
| 44632.75 | 11.092 |
| 44632.760416666664 | 10.905 |
| 44632.770833333336 | 10.709 |
| 44632.78125 | 11.024 |
| 44632.791666666664 | 10.954 |
| 44632.802083333336 | 10.875 |
| 44632.8125 | 10.719 |
| 44632.822916666664 | 10.475 |
| 44632.833333333336 | 10.227 |
| 44632.84375 | 10.074 |
| 44632.854166666664 | 9.942 |
| 44632.864583333336 | 9.852 |
| 44632.875 | 9.8 |
| 44632.885416666664 | 9.777 |
| 44632.895833333336 | 9.63 |
| 44632.90625 | 9.523 |
| 44632.916666666664 | 9.526 |
| 44632.927083333336 | 9.453 |
| 44632.9375 | 9.349 |
| 44632.947916666664 | 9.35 |
| 44632.958333333336 | 9.296 |
| 44632.96875 | 9.218 |
| 44632.979166666664 | 9.074 |
| 44632.989583333336 | 8.794 |
| 44633.0 | 8.757 |
| 44633.010416666664 | 8.926 |
| 44633.020833333336 | 8.819 |
| 44633.03125 | 8.739 |
| 44633.041666666664 | 8.67 |
| 44633.052083333336 | 8.622 |
| 44633.0625 | 8.323 |
| 44633.072916666664 | 8.196 |
| 44633.083333333336 | 8.031 |
| 44633.09375 | 7.967 |
| 44633.104166666664 | 7.771 |
| 44633.114583333336 | 7.746 |
| 44633.125 | 7.788 |
| 44633.135416666664 | 7.819 |
| 44633.145833333336 | 8.012 |
| 44633.15625 | 7.946 |
| 44633.166666666664 | 7.907 |
| 44633.177083333336 | 7.621 |
| 44633.1875 | 7.498 |
| 44633.197916666664 | 7.268 |
| 44633.208333333336 | 7.366 |
| 44633.21875 | 8.234 |
| 44633.229166666664 | 8.159 |
| 44633.239583333336 | 7.687 |
| 44633.25 | 7.198 |
| 44633.260416666664 | 6.342 |
| 44633.270833333336 | 5.878 |
| 44633.28125 | 5.489 |
| 44633.291666666664 | 5.325 |
| 44633.302083333336 | 5.164 |
| 44633.3125 | 4.979 |
| 44633.322916666664 | 4.911 |
| 44633.333333333336 | 4.832 |
| 44633.34375 | 4.779 |
| 44633.354166666664 | 4.76 |
| 44633.364583333336 | 4.658 |
| 44633.375 | 4.553 |
| 44633.385416666664 | 4.618 |
| 44633.395833333336 | 4.672 |
| 44633.40625 | 4.692 |
| 44633.416666666664 | 4.679 |
| 44633.427083333336 | 4.687 |
| 44633.4375 | 4.626 |
| 44633.447916666664 | 4.718 |
| 44633.458333333336 | 4.573 |
| 44633.46875 | 4.338 |
| 44633.479166666664 | 4.257 |
| 44633.489583333336 | 4.254 |
| 44633.5 | 4.127 |
| 44633.510416666664 | 3.551 |
| 44633.520833333336 | 3.511 |
| 44633.53125 | 3.611 |
| 44633.541666666664 | 3.782 |
| 44633.552083333336 | 3.888 |
| 44633.5625 | 3.866 |
| 44633.572916666664 | 3.854 |
| 44633.583333333336 | 3.828 |
| 44633.59375 | 3.686 |
| 44633.604166666664 | 3.652 |
| 44633.614583333336 | 3.674 |
| 44633.625 | 3.67 |
| 44633.635416666664 | 3.774 |
| 44633.645833333336 | 3.889 |
| 44633.65625 | 3.994 |
| 44633.666666666664 | 4.12 |
| 44633.677083333336 | 4.161 |
| 44633.6875 | 4.192 |
| 44633.697916666664 | 4.346 |
| 44633.708333333336 | 4.389 |
| 44633.71875 | 4.468 |
| 44633.729166666664 | 4.578 |
| 44633.739583333336 | 4.465 |
| 44633.75 | 4.632 |
| 44633.760416666664 | 4.662 |
| 44633.770833333336 | 5.041 |
| 44633.78125 | 5.172 |
| 44633.791666666664 | 5.397 |
| 44633.802083333336 | 5.657 |
| 44633.8125 | 5.98 |
| 44633.822916666664 | 6.211 |
| 44633.833333333336 | 6.454 |
| 44633.84375 | 6.823 |
| 44633.854166666664 | 7.094 |
| 44633.864583333336 | 7.203 |
| 44633.875 | 7.393 |
| 44633.885416666664 | 7.441 |
| 44633.895833333336 | 7.524 |
| 44633.90625 | 7.577 |
| 44633.916666666664 | 7.626 |
| 44633.927083333336 | 7.64 |
| 44633.9375 | 7.747 |
| 44633.947916666664 | 7.664 |
| 44633.958333333336 | 7.595 |
| 44633.96875 | 7.602 |
| 44633.979166666664 | 7.471 |
| 44633.989583333336 | 7.474 |
| 44634.0 | 7.333 |
| 44634.010416666664 | 7.268 |
| 44634.020833333336 | 7.143 |
| 44634.03125 | 7.107 |
| 44634.041666666664 | 7.121 |
| 44634.052083333336 | 7.003 |
| 44634.0625 | 6.966 |
| 44634.072916666664 | 5.911 |
| 44634.083333333336 | 4.99 |
| 44634.09375 | 4.976 |
| 44634.104166666664 | 4.941 |
| 44634.114583333336 | 4.97 |
| 44634.125 | 4.981 |
| 44634.135416666664 | 4.948 |
| 44634.145833333336 | 4.872 |
| 44634.15625 | 4.996 |
| 44634.166666666664 | 4.948 |
| 44634.177083333336 | 4.903 |
| 44634.1875 | 4.921 |
| 44634.197916666664 | 5.097 |
| 44634.208333333336 | 5.147 |
| 44634.21875 | 5.201 |
| 44634.229166666664 | 5.296 |
| 44634.239583333336 | 5.611 |
| 44634.25 | 5.639 |
| 44634.260416666664 | 5.931 |
| 44634.270833333336 | 5.858 |
| 44634.28125 | 5.843 |
| 44634.291666666664 | 5.906 |
| 44634.302083333336 | 5.929 |
| 44634.3125 | 5.915 |
| 44634.322916666664 | 5.841 |
| 44634.333333333336 | 5.726 |
| 44634.34375 | 5.595 |
| 44634.354166666664 | 5.51 |
| 44634.364583333336 | 5.449 |
| 44634.375 | 5.393 |
| 44634.385416666664 | 5.315 |
| 44634.395833333336 | 5.262 |
| 44634.40625 | 5.249 |
| 44634.416666666664 | 5.249 |
| 44634.427083333336 | 5.271 |
| 44634.4375 | 5.29 |
| 44634.447916666664 | 5.265 |
| 44634.458333333336 | 5.24 |
| 44634.46875 | 5.189 |
| 44634.479166666664 | 5.183 |
| 44634.489583333336 | 5.181 |
| 44634.5 | 5.153 |
| 44634.510416666664 | 5.246 |
| 44634.520833333336 | 5.056 |
| 44634.53125 | 4.837 |
| 44634.541666666664 | 4.895 |
| 44634.552083333336 | 4.951 |
| 44634.5625 | 4.81 |
| 44634.572916666664 | 4.945 |
| 44634.583333333336 | 5.228 |
| 44634.59375 | 5.283 |
| 44634.604166666664 | 5.463 |
| 44634.614583333336 | 5.564 |
| 44634.625 | 5.754 |
| 44634.635416666664 | 5.762 |
| 44634.645833333336 | 5.847 |
| 44634.65625 | 6.386 |
| 44634.666666666664 | 6.385 |
| 44634.677083333336 | 6.524 |
| 44634.6875 | 6.847 |
| 44634.697916666664 | 6.735 |
| 44634.708333333336 | 6.442 |
| 44634.71875 | 7.072 |
| 44634.729166666664 | 7.11 |
| 44634.739583333336 | 6.938 |
| 44634.75 | 6.805 |
| 44634.760416666664 | 6.961 |
| 44634.770833333336 | 6.918 |
| 44634.78125 | 6.795 |
| 44634.791666666664 | 7.066 |
| 44634.802083333336 | 7.337 |
| 44634.8125 | 7.394 |
| 44634.822916666664 | 8.338 |
| 44634.833333333336 | 8.371 |
| 44634.84375 | 8.396 |
| 44634.854166666664 | 8.996 |
| 44634.864583333336 | 9.628 |
| 44634.875 | 9.908 |
| 44634.885416666664 | 10.141 |
| 44634.895833333336 | 10.319 |
| 44634.90625 | 10.409 |
| 44634.916666666664 | 10.472 |
| 44634.927083333336 | 10.495 |
| 44634.9375 | 10.461 |
| 44634.947916666664 | 10.38 |
| 44634.958333333336 | 10.28 |
| 44634.96875 | 10.001 |
| 44634.979166666664 | 9.833 |
| 44634.989583333336 | 9.85 |
| 44635.0 | 9.808 |
| 44635.010416666664 | 9.826 |
| 44635.020833333336 | 9.92 |
| 44635.03125 | 9.938 |
| 44635.041666666664 | 10.107 |
| 44635.052083333336 | 10.054 |
| 44635.0625 | 10.075 |
| 44635.072916666664 | 9.472 |
| 44635.083333333336 | 9.369 |
| 44635.09375 | 9.072 |
| 44635.104166666664 | 8.471 |
| 44635.114583333336 | 7.906 |
| 44635.125 | 7.62 |
| 44635.135416666664 | 7.532 |
| 44635.145833333336 | 7.435 |
| 44635.15625 | 7.279 |
| 44635.166666666664 | 7.374 |
| 44635.177083333336 | 7.339 |
| 44635.1875 | 7.329 |
| 44635.197916666664 | 7.374 |
| 44635.208333333336 | 7.267 |
| 44635.21875 | 7.278 |
| 44635.229166666664 | 7.465 |
| 44635.239583333336 | 7.669 |
| 44635.25 | 7.74 |
| 44635.260416666664 | 7.822 |
| 44635.270833333336 | 8.287 |
| 44635.28125 | 8.281 |
| 44635.291666666664 | 8.514 |
| 44635.302083333336 | 8.622 |
| 44635.3125 | 8.71 |
| 44635.322916666664 | 8.789 |
| 44635.333333333336 | 8.761 |
| 44635.34375 | 8.668 |
| 44635.354166666664 | 8.513 |
| 44635.364583333336 | 8.364 |
| 44635.375 | 8.202 |
| 44635.385416666664 | 8.028 |
| 44635.395833333336 | 7.873 |
| 44635.40625 | 7.703 |
| 44635.416666666664 | 7.543 |
| 44635.427083333336 | 7.422 |
| 44635.4375 | 7.354 |
| 44635.447916666664 | 7.26 |
| 44635.458333333336 | 7.198 |
| 44635.46875 | 7.174 |
| 44635.479166666664 | 7.144 |
| 44635.489583333336 | 7.166 |
| 44635.5 | 7.286 |
| 44635.510416666664 | 7.169 |
| 44635.520833333336 | 7.213 |
| 44635.53125 | 7.155 |
| 44635.541666666664 | 7.125 |
| 44635.552083333336 | 7.062 |
| 44635.5625 | 7.168 |
| 44635.572916666664 | 7.283 |
| 44635.583333333336 | 7.421 |
| 44635.59375 | 7.496 |
| 44635.604166666664 | 7.641 |
| 44635.614583333336 | 7.781 |
| 44635.625 | 7.926 |
| 44635.635416666664 | 8.044 |
| 44635.645833333336 | 8.148 |
| 44635.65625 | 8.338 |
| 44635.666666666664 | 8.501 |
| 44635.677083333336 | 8.565 |
| 44635.6875 | 8.64 |
| 44635.697916666664 | 8.8 |
| 44635.708333333336 | 8.989 |
| 44635.71875 | 9.056 |
| 44635.729166666664 | 9.248 |
| 44635.739583333336 | 9.144 |
| 44635.75 | 9.126 |
| 44635.760416666664 | 9.109 |
| 44635.770833333336 | 9.035 |
| 44635.78125 | 9.026 |
| 44635.791666666664 | 9.155 |
| 44635.802083333336 | 9.44 |
| 44635.8125 | 9.547 |
| 44635.822916666664 | 9.919 |
| 44635.833333333336 | 10.257 |
| 44635.84375 | 10.458 |
| 44635.854166666664 | 10.708 |
| 44635.864583333336 | 10.991 |
| 44635.875 | 11.117 |
| 44635.885416666664 | 11.208 |
| 44635.895833333336 | 11.245 |
| 44635.90625 | 11.254 |
| 44635.916666666664 | 11.248 |
| 44635.927083333336 | 11.164 |
| 44635.9375 | 11.018 |
| 44635.947916666664 | 10.875 |
| 44635.958333333336 | 10.724 |
| 44635.96875 | 10.61 |
| 44635.979166666664 | 10.518 |
| 44635.989583333336 | 10.434 |
| 44636.0 | 10.421 |
| 44636.010416666664 | 10.323 |
| 44636.020833333336 | 10.229 |
| 44636.03125 | 10.624 |
| 44636.041666666664 | 10.548 |
| 44636.052083333336 | 10.551 |
| 44636.0625 | 10.653 |
| 44636.072916666664 | 10.658 |
| 44636.083333333336 | 10.612 |
| 44636.09375 | 10.674 |
| 44636.104166666664 | 10.631 |
| 44636.114583333336 | 10.778 |
| 44636.125 | 10.814 |
| 44636.135416666664 | 10.712 |
| 44636.145833333336 | 10.54 |
| 44636.15625 | 10.427 |
| 44636.166666666664 | 10.359 |
| 44636.177083333336 | 10.307 |
| 44636.1875 | 10.314 |
| 44636.197916666664 | 10.274 |
| 44636.208333333336 | 10.243 |
| 44636.21875 | 10.198 |
| 44636.229166666664 | 10.153 |
| 44636.239583333336 | 10.128 |
| 44636.25 | 10.144 |
| 44636.260416666664 | 10.129 |
| 44636.270833333336 | 10.099 |
| 44636.28125 | 10.118 |
| 44636.291666666664 | 10.138 |
| 44636.302083333336 | 10.185 |
| 44636.3125 | 10.26 |
| 44636.322916666664 | 10.354 |
| 44636.333333333336 | 10.288 |
| 44636.34375 | 10.216 |
| 44636.354166666664 | 10.186 |
| 44636.364583333336 | 10.14 |
| 44636.375 | 10.065 |
| 44636.385416666664 | 9.989 |
| 44636.395833333336 | 9.897 |
| 44636.40625 | 9.821 |
| 44636.416666666664 | 9.756 |
| 44636.427083333336 | 9.661 |
| 44636.4375 | 9.522 |
| 44636.447916666664 | 9.35 |
| 44636.458333333336 | 9.133 |
| 44636.46875 | 8.924 |
| 44636.479166666664 | 8.826 |
| 44636.489583333336 | 8.756 |
| 44636.5 | 8.697 |
| 44636.510416666664 | 8.674 |
| 44636.520833333336 | 8.73 |
| 44636.53125 | 8.666 |
| 44636.541666666664 | 8.774 |
| 44636.552083333336 | 8.846 |
| 44636.5625 | 8.961 |
| 44636.572916666664 | 9.055 |
| 44636.583333333336 | 9.038 |
| 44636.59375 | 8.988 |
| 44636.604166666664 | 9.178 |
| 44636.614583333336 | 9.576 |
| 44636.625 | 9.717 |
| 44636.635416666664 | 9.931 |
| 44636.645833333336 | 10.096 |
| 44636.65625 | 10.278 |
| 44636.666666666664 | 10.515 |
| 44636.677083333336 | 10.682 |
| 44636.6875 | 10.83 |
| 44636.697916666664 | 10.95 |
| 44636.708333333336 | 11.067 |
| 44636.71875 | 11.285 |
| 44636.729166666664 | 11.454 |
| 44636.739583333336 | 11.474 |
| 44636.75 | 11.723 |
| 44636.760416666664 | 11.84 |
| 44636.770833333336 | 11.85 |
| 44636.78125 | 11.963 |
| 44636.791666666664 | 11.923 |
| 44636.802083333336 | 11.94 |
| 44636.8125 | 11.799 |
| 44636.822916666664 | 11.75 |
| 44636.833333333336 | 11.587 |
| 44636.84375 | 11.542 |
| 44636.854166666664 | 11.631 |
| 44636.864583333336 | 11.707 |
| 44636.875 | 11.71 |
| 44636.885416666664 | 11.784 |
| 44636.895833333336 | 12.052 |
| 44636.90625 | 12.034 |
| 44636.916666666664 | 12.025 |
| 44636.927083333336 | 12.031 |
| 44636.9375 | 12.019 |
| 44636.947916666664 | 11.971 |
| 44636.958333333336 | 11.883 |
| 44636.96875 | 11.718 |
| 44636.979166666664 | 11.501 |
| 44636.989583333336 | 11.316 |
| 44637.0 | 11.149 |
| 44637.010416666664 | 11.072 |
| 44637.020833333336 | 10.98 |
| 44637.03125 | 10.804 |
| 44637.041666666664 | 10.757 |
| 44637.052083333336 | 11.058 |
| 44637.0625 | 11.184 |
| 44637.072916666664 | 11.204 |
| 44637.083333333336 | 11.346 |
| 44637.09375 | 11.237 |
| 44637.104166666664 | 11.231 |
| 44637.114583333336 | 11.6 |
| 44637.125 | 11.686 |
| 44637.135416666664 | 11.897 |
| 44637.145833333336 | 12.195 |
| 44637.15625 | 12.363 |
| 44637.166666666664 | 12.445 |
| 44637.177083333336 | 12.498 |
| 44637.1875 | 12.509 |
| 44637.197916666664 | 12.495 |
| 44637.208333333336 | 12.492 |
| 44637.21875 | 12.493 |
| 44637.229166666664 | 12.503 |
| 44637.239583333336 | 12.509 |
| 44637.25 | 12.53 |
| 44637.260416666664 | 12.54 |
| 44637.270833333336 | 12.542 |
| 44637.28125 | 12.542 |
| 44637.291666666664 | 12.513 |
| 44637.302083333336 | 12.489 |
| 44637.3125 | 12.471 |
| 44637.322916666664 | 12.445 |
| 44637.333333333336 | 12.419 |
| 44637.34375 | 12.319 |
| 44637.354166666664 | 12.141 |
| 44637.364583333336 | 11.962 |
| 44637.375 | 11.876 |
| 44637.385416666664 | 11.751 |
| 44637.395833333336 | 11.679 |
| 44637.40625 | 11.526 |
| 44637.416666666664 | 11.397 |
| 44637.427083333336 | 11.271 |
| 44637.4375 | 11.145 |
| 44637.447916666664 | 11.044 |
| 44637.458333333336 | 10.861 |
| 44637.46875 | 10.713 |
| 44637.479166666664 | 10.59 |
| 44637.489583333336 | 10.504 |
| 44637.5 | 10.448 |
| 44637.510416666664 | 10.416 |
| 44637.520833333336 | 10.373 |
| 44637.53125 | 10.397 |
| 44637.541666666664 | 10.417 |
| 44637.552083333336 | 10.576 |
| 44637.5625 | 10.551 |
| 44637.572916666664 | 10.649 |
| 44637.583333333336 | 10.796 |
| 44637.59375 | 10.62 |
| 44637.604166666664 | 10.595 |
| 44637.614583333336 | 11.108 |
| 44637.625 | 11.143 |
| 44637.635416666664 | 11.4 |
| 44637.645833333336 | 11.891 |
| 44637.65625 | 12.205 |
| 44637.666666666664 | 12.666 |
| 44637.677083333336 | 12.594 |
| 44637.6875 | 12.762 |
| 44637.697916666664 | 13.106 |
| 44637.708333333336 | 13.272 |
| 44637.71875 | 13.177 |
| 44637.729166666664 | 13.263 |
| 44637.739583333336 | 13.293 |
| 44637.75 | 13.518 |
| 44637.760416666664 | 13.618 |
| 44637.770833333336 | 13.765 |
| 44637.78125 | 13.884 |
| 44637.791666666664 | 13.934 |
| 44637.802083333336 | 13.945 |
| 44637.8125 | 14.084 |
| 44637.822916666664 | 13.898 |
| 44637.833333333336 | 13.782 |
| 44637.84375 | 13.679 |
| 44637.854166666664 | 13.572 |
| 44637.864583333336 | 13.5 |
| 44637.875 | 13.28 |
| 44637.885416666664 | 12.932 |
| 44637.895833333336 | 12.688 |
| 44637.90625 | 12.697 |
| 44637.916666666664 | 12.701 |
| 44637.927083333336 | 12.571 |
| 44637.9375 | 12.508 |
| 44637.947916666664 | 12.391 |
| 44637.958333333336 | 12.276 |
| 44637.96875 | 12.189 |
| 44637.979166666664 | 12.121 |
| 44637.989583333336 | 12.038 |
| 44638.0 | 11.925 |
| 44638.010416666664 | 11.777 |
| 44638.020833333336 | 11.656 |
| 44638.03125 | 11.58 |
| 44638.041666666664 | 11.569 |
| 44638.052083333336 | 11.485 |
| 44638.0625 | 11.443 |
| 44638.072916666664 | 11.591 |
| 44638.083333333336 | 11.594 |
| 44638.09375 | 11.614 |
| 44638.104166666664 | 11.837 |
| 44638.114583333336 | 11.926 |
| 44638.125 | 12.005 |
| 44638.135416666664 | 12.114 |
| 44638.145833333336 | 12.199 |
| 44638.15625 | 12.437 |
| 44638.166666666664 | 12.363 |
| 44638.177083333336 | 12.477 |
| 44638.1875 | 12.629 |
| 44638.197916666664 | 12.84 |
| 44638.208333333336 | 13.047 |
| 44638.21875 | 13.223 |
| 44638.229166666664 | 13.374 |
| 44638.239583333336 | 13.45 |
| 44638.25 | 13.521 |
| 44638.260416666664 | 13.571 |
| 44638.270833333336 | 13.578 |
| 44638.28125 | 13.601 |
| 44638.291666666664 | 13.597 |
| 44638.302083333336 | 13.577 |
| 44638.3125 | 13.615 |
| 44638.322916666664 | 13.604 |
| 44638.333333333336 | 13.549 |
| 44638.34375 | 13.563 |
| 44638.354166666664 | 13.536 |
| 44638.364583333336 | 13.474 |
| 44638.375 | 13.236 |
| 44638.385416666664 | 12.933 |
| 44638.395833333336 | 12.598 |
| 44638.40625 | 12.52 |
| 44638.416666666664 | 12.499 |
| 44638.427083333336 | 12.409 |
| 44638.4375 | 12.327 |
| 44638.447916666664 | 12.232 |
| 44638.458333333336 | 12.144 |
| 44638.46875 | 12.002 |
| 44638.479166666664 | 11.883 |
| 44638.489583333336 | 11.73 |
| 44638.5 | 11.633 |
| 44638.510416666664 | 11.589 |
| 44638.520833333336 | 11.567 |
| 44638.53125 | 11.574 |
| 44638.541666666664 | 11.603 |
| 44638.552083333336 | 11.624 |
| 44638.5625 | 11.648 |
| 44638.572916666664 | 11.675 |
| 44638.583333333336 | 11.689 |
| 44638.59375 | 11.714 |
| 44638.604166666664 | 11.831 |
| 44638.614583333336 | 11.953 |
| 44638.625 | 12.021 |
| 44638.635416666664 | 12.37 |
| 44638.645833333336 | 12.66 |
| 44638.65625 | 13.009 |
| 44638.666666666664 | 13.809 |
| 44638.677083333336 | 14.206 |
| 44638.6875 | 14.598 |
| 44638.697916666664 | 14.542 |
| 44638.708333333336 | 14.561 |
| 44638.71875 | 14.846 |
| 44638.729166666664 | 15.2 |
| 44638.739583333336 | 15.412 |
| 44638.75 | 16.058 |
| 44638.760416666664 | 15.951 |
| 44638.770833333336 | 15.827 |
| 44638.78125 | 15.953 |
| 44638.791666666664 | 16.088 |
| 44638.802083333336 | 16.097 |
| 44638.8125 | 16.349 |
| 44638.822916666664 | 16.35 |
| 44638.833333333336 | 16.264 |
| 44638.84375 | 16.216 |
| 44638.854166666664 | 15.93 |
| 44638.864583333336 | 15.848 |
| 44638.875 | 15.777 |
| 44638.885416666664 | 15.719 |
| 44638.895833333336 | 15.643 |
| 44638.90625 | 15.568 |
| 44638.916666666664 | 15.504 |
| 44638.927083333336 | 15.4 |
| 44638.9375 | 15.252 |
| 44638.947916666664 | 15.113 |
| 44638.958333333336 | 14.972 |
| 44638.96875 | 14.84 |
| 44638.979166666664 | 14.726 |
| 44638.989583333336 | 14.526 |
| 44639.0 | 14.238 |
| 44639.010416666664 | 14.044 |
| 44639.020833333336 | 13.89 |
| 44639.03125 | 13.795 |
| 44639.041666666664 | 13.736 |
| 44639.052083333336 | 13.708 |
| 44639.0625 | 13.633 |
| 44639.072916666664 | 13.654 |
| 44639.083333333336 | 13.607 |
| 44639.09375 | 13.524 |
| 44639.104166666664 | 13.502 |
| 44639.114583333336 | 13.443 |
| 44639.125 | 13.603 |
| 44639.135416666664 | 13.629 |
| 44639.145833333336 | 13.681 |
| 44639.15625 | 13.756 |
| 44639.166666666664 | 13.77 |
| 44639.177083333336 | 13.765 |
| 44639.1875 | 13.784 |
| 44639.197916666664 | 13.822 |
| 44639.208333333336 | 13.9 |
| 44639.21875 | 13.982 |
| 44639.229166666664 | 14.154 |
| 44639.239583333336 | 14.303 |
| 44639.25 | 14.452 |
| 44639.260416666664 | 14.604 |
| 44639.270833333336 | 14.683 |
| 44639.28125 | 14.75 |
| 44639.291666666664 | 14.757 |
| 44639.302083333336 | 14.809 |
| 44639.3125 | 14.829 |
| 44639.322916666664 | 14.878 |
| 44639.333333333336 | 14.938 |
| 44639.34375 | 14.937 |
| 44639.354166666664 | 14.882 |
| 44639.364583333336 | 14.901 |
| 44639.375 | 14.865 |
| 44639.385416666664 | 14.804 |
| 44639.395833333336 | 14.659 |
| 44639.40625 | 14.443 |
| 44639.416666666664 | 14.263 |
| 44639.427083333336 | 14.153 |
| 44639.4375 | 14 |
| 44639.447916666664 | 13.879 |
| 44639.458333333336 | 13.733 |
| 44639.46875 | 13.624 |
| 44639.479166666664 | 13.525 |
| 44639.489583333336 | 13.421 |
| 44639.5 | 13.327 |
| 44639.510416666664 | 13.229 |
| 44639.520833333336 | 13.148 |
| 44639.53125 | 13.114 |
| 44639.541666666664 | 13.086 |
| 44639.552083333336 | 13.094 |
| 44639.5625 | 13.133 |
| 44639.572916666664 | 13.202 |
| 44639.583333333336 | 13.267 |
| 44639.59375 | 13.332 |
| 44639.604166666664 | 13.383 |
| 44639.614583333336 | 13.382 |
| 44639.625 | 13.651 |
| 44639.635416666664 | 13.772 |
| 44639.645833333336 | 14.235 |
| 44639.65625 | 14.44 |
| 44639.666666666664 | 14.9 |
| 44639.677083333336 | 15.222 |
| 44639.6875 | 15.662 |
| 44639.697916666664 | 16.165 |
| 44639.708333333336 | 16.704 |
| 44639.71875 | 16.867 |
| 44639.729166666664 | 16.785 |
| 44639.739583333336 | 16.617 |
| 44639.75 | 16.914 |
| 44639.760416666664 | 17.215 |
| 44639.770833333336 | 17.342 |
| 44639.78125 | 17.558 |
| 44639.791666666664 | 17.682 |
| 44639.802083333336 | 17.755 |
| 44639.8125 | 18.033 |
| 44639.822916666664 | 18.097 |
| 44639.833333333336 | 18.243 |
| 44639.84375 | 18.307 |
| 44639.854166666664 | 18.345 |
| 44639.864583333336 | 18.258 |
| 44639.875 | 18.056 |
| 44639.885416666664 | 17.903 |
| 44639.895833333336 | 17.829 |
| 44639.90625 | 17.773 |
| 44639.916666666664 | 17.718 |
| 44639.927083333336 | 17.643 |
| 44639.9375 | 17.576 |
| 44639.947916666664 | 17.541 |
| 44639.958333333336 | 17.636 |
| 44639.96875 | 17.589 |
| 44639.979166666664 | 17.521 |
| 44639.989583333336 | 17.362 |
| 44640.0 | 17.17 |
| 44640.010416666664 | 16.809 |
| 44640.020833333336 | 16.478 |
| 44640.03125 | 16.276 |
| 44640.041666666664 | 16.111 |
| 44640.052083333336 | 16.052 |
| 44640.0625 | 16.004 |
| 44640.072916666664 | 15.956 |
| 44640.083333333336 | 15.867 |
| 44640.09375 | 15.782 |
| 44640.104166666664 | 15.693 |
| 44640.114583333336 | 15.606 |
| 44640.125 | 15.558 |
| 44640.135416666664 | 15.804 |
| 44640.145833333336 | 15.736 |
| 44640.15625 | 15.743 |
| 44640.166666666664 | 15.876 |
| 44640.177083333336 | 15.979 |
| 44640.1875 | 15.843 |
| 44640.197916666664 | 15.918 |
| 44640.208333333336 | 15.911 |
| 44640.21875 | 15.992 |
| 44640.229166666664 | 16.052 |
| 44640.239583333336 | 16.169 |
| 44640.25 | 16.347 |
| 44640.260416666664 | 16.549 |
| 44640.270833333336 | 16.717 |
| 44640.28125 | 16.811 |
| 44640.291666666664 | 16.846 |
| 44640.302083333336 | 16.864 |
| 44640.3125 | 16.852 |
| 44640.322916666664 | 16.893 |
| 44640.333333333336 | 16.907 |
| 44640.34375 | 16.976 |
| 44640.354166666664 | 16.933 |
| 44640.364583333336 | 16.87 |
| 44640.375 | 17.001 |
| 44640.385416666664 | 16.907 |
| 44640.395833333336 | 16.849 |
| 44640.40625 | 16.86 |
| 44640.416666666664 | 16.822 |
| 44640.427083333336 | 16.662 |
| 44640.4375 | 16.326 |
| 44640.447916666664 | 16.023 |
| 44640.458333333336 | 15.839 |
| 44640.46875 | 15.682 |
| 44640.479166666664 | 15.572 |
| 44640.489583333336 | 15.49 |
| 44640.5 | 15.322 |
| 44640.510416666664 | 15.112 |
| 44640.520833333336 | 14.944 |
| 44640.53125 | 14.831 |
| 44640.541666666664 | 14.758 |
| 44640.552083333336 | 14.683 |
| 44640.5625 | 14.592 |
| 44640.572916666664 | 14.468 |
| 44640.583333333336 | 14.37 |
| 44640.59375 | 14.302 |
| 44640.604166666664 | 14.283 |
| 44640.614583333336 | 14.298 |
| 44640.625 | 14.325 |
| 44640.635416666664 | 14.344 |
| 44640.645833333336 | 14.437 |
| 44640.65625 | 14.484 |
| 44640.666666666664 | 14.598 |
| 44640.677083333336 | 14.665 |
| 44640.6875 | 14.838 |
| 44640.697916666664 | 14.921 |
| 44640.708333333336 | 15.428 |
| 44640.71875 | 15.956 |
| 44640.729166666664 | 16.3 |
| 44640.739583333336 | 16.564 |
| 44640.75 | 16.41 |
| 44640.760416666664 | 16.405 |
| 44640.770833333336 | 16.94 |
| 44640.78125 | 17.314 |
| 44640.791666666664 | 17.483 |
| 44640.802083333336 | 17.46 |
| 44640.8125 | 17.484 |
| 44640.822916666664 | 17.439 |
| 44640.833333333336 | 17.562 |
| 44640.84375 | 17.574 |
| 44640.854166666664 | 17.593 |
| 44640.864583333336 | 17.555 |
| 44640.875 | 17.512 |
| 44640.885416666664 | 17.512 |
| 44640.895833333336 | 17.471 |
| 44640.90625 | 17.401 |
| 44640.916666666664 | 17.362 |
| 44640.927083333336 | 17.293 |
| 44640.9375 | 16.994 |
| 44640.947916666664 | 16.409 |
| 44640.958333333336 | 16.242 |
| 44640.96875 | 16.163 |
| 44640.979166666664 | 15.998 |
| 44640.989583333336 | 15.812 |
| 44641.0 | 15.596 |
| 44641.010416666664 | 15.398 |
| 44641.020833333336 | 15.234 |
| 44641.03125 | 14.971 |
| 44641.041666666664 | 14.755 |
| 44641.052083333336 | 14.628 |
| 44641.0625 | 14.51 |
| 44641.072916666664 | 14.393 |
| 44641.083333333336 | 14.289 |
| 44641.09375 | 14.203 |
| 44641.104166666664 | 14.138 |
| 44641.114583333336 | 14.092 |
| 44641.125 | 14.049 |
| 44641.135416666664 | 14.004 |
| 44641.145833333336 | 13.982 |
| 44641.15625 | 13.97 |
| 44641.166666666664 | 13.911 |
| 44641.177083333336 | 14.005 |
| 44641.1875 | 13.904 |
| 44641.197916666664 | 13.751 |
| 44641.208333333336 | 13.629 |
| 44641.21875 | 13.427 |
| 44641.229166666664 | 13.262 |
| 44641.239583333336 | 13.218 |
| 44641.25 | 13.011 |
| 44641.260416666664 | 12.612 |
| 44641.270833333336 | 12.653 |
| 44641.28125 | 12.592 |
| 44641.291666666664 | 12.871 |
| 44641.302083333336 | 13.103 |
| 44641.3125 | 13.163 |
| 44641.322916666664 | 13.175 |
| 44641.333333333336 | 13.123 |
| 44641.34375 | 13.153 |
| 44641.354166666664 | 13.05 |
| 44641.364583333336 | 12.973 |
| 44641.375 | 12.945 |
| 44641.385416666664 | 12.879 |
| 44641.395833333336 | 12.863 |
| 44641.40625 | 12.898 |
| 44641.416666666664 | 12.839 |
| 44641.427083333336 | 12.889 |
| 44641.4375 | 12.939 |
| 44641.447916666664 | 12.935 |
| 44641.458333333336 | 12.851 |
| 44641.46875 | 12.659 |
| 44641.479166666664 | 12.433 |
| 44641.489583333336 | 12.259 |
| 44641.5 | 12.092 |
| 44641.510416666664 | 12.025 |
| 44641.520833333336 | 11.982 |
| 44641.53125 | 11.92 |
| 44641.541666666664 | 11.866 |
| 44641.552083333336 | 11.836 |
| 44641.5625 | 11.824 |
| 44641.572916666664 | 11.858 |
| 44641.583333333336 | 11.956 |
| 44641.59375 | 12.063 |
| 44641.604166666664 | 12.107 |
| 44641.614583333336 | 12.156 |
| 44641.625 | 12.207 |
| 44641.635416666664 | 12.26 |
| 44641.645833333336 | 12.317 |
| 44641.65625 | 12.356 |
| 44641.666666666664 | 12.442 |
| 44641.677083333336 | 12.52 |
| 44641.6875 | 12.689 |
| 44641.697916666664 | 12.912 |
| 44641.708333333336 | 13.059 |
| 44641.71875 | 13.318 |
| 44641.729166666664 | 13.745 |
| 44641.739583333336 | 14.16 |
| 44641.75 | 14.222 |
| 44641.760416666664 | 14.19 |
| 44641.770833333336 | 14.334 |
| 44641.78125 | 14.405 |
| 44641.791666666664 | 14.523 |
| 44641.802083333336 | 14.776 |
| 44641.8125 | 15.082 |
| 44641.822916666664 | 15.149 |
| 44641.833333333336 | 15.442 |
| 44641.84375 | 15.531 |
| 44641.854166666664 | 15.592 |
| 44641.864583333336 | 15.653 |
| 44641.875 | 15.7 |
| 44641.885416666664 | 15.798 |
| 44641.895833333336 | 15.732 |
| 44641.90625 | 15.744 |
| 44641.916666666664 | 15.708 |
| 44641.927083333336 | 15.645 |
| 44641.9375 | 15.597 |
| 44641.947916666664 | 15.51 |
| 44641.958333333336 | 15.406 |
| 44641.96875 | 15.28 |
| 44641.979166666664 | 15.078 |
| 44641.989583333336 | 14.893 |
| 44642.0 | 14.739 |
| 44642.010416666664 | 14.601 |
| 44642.020833333336 | 14.458 |
| 44642.03125 | 14.356 |
| 44642.041666666664 | 14.281 |
| 44642.052083333336 | 14.217 |
| 44642.0625 | 14.134 |
| 44642.072916666664 | 14.015 |
| 44642.083333333336 | 13.893 |
| 44642.09375 | 13.797 |
| 44642.104166666664 | 13.716 |
| 44642.114583333336 | 13.681 |
| 44642.125 | 13.678 |
| 44642.135416666664 | 13.691 |
| 44642.145833333336 | 13.708 |
| 44642.15625 | 13.725 |
| 44642.166666666664 | 13.711 |
| 44642.177083333336 | 13.701 |
| 44642.1875 | 13.714 |
| 44642.197916666664 | 13.693 |
| 44642.208333333336 | 13.6 |
| 44642.21875 | 13.527 |
| 44642.229166666664 | 13.336 |
| 44642.239583333336 | 13.211 |
| 44642.25 | 13.141 |
| 44642.260416666664 | 13.033 |
| 44642.270833333336 | 12.952 |
| 44642.28125 | 12.867 |
| 44642.291666666664 | 12.784 |
| 44642.302083333336 | 12.792 |
| 44642.3125 | 12.797 |
| 44642.322916666664 | 12.995 |
| 44642.333333333336 | 13.168 |
| 44642.34375 | 13.254 |
| 44642.354166666664 | 13.248 |
| 44642.364583333336 | 13.254 |
| 44642.375 | 13.349 |
| 44642.385416666664 | 13.265 |
| 44642.395833333336 | 13.231 |
| 44642.40625 | 13.201 |
| 44642.416666666664 | 13.135 |
| 44642.427083333336 | 13.076 |
| 44642.4375 | 13.06 |
| 44642.447916666664 | 13.08 |
| 44642.458333333336 | 13.045 |
| 44642.46875 | 13.165 |
| 44642.479166666664 | 13.2 |
| 44642.489583333336 | 13.204 |
| 44642.5 | 13.1 |
| 44642.510416666664 | 12.965 |
| 44642.520833333336 | 12.873 |
| 44642.53125 | 12.759 |
| 44642.541666666664 | 12.618 |
| 44642.552083333336 | 12.501 |
| 44642.5625 | 12.457 |
| 44642.572916666664 | 12.389 |
| 44642.583333333336 | 12.356 |
| 44642.59375 | 12.352 |
| 44642.604166666664 | 12.398 |
| 44642.614583333336 | 12.479 |
| 44642.625 | 12.613 |
| 44642.635416666664 | 12.755 |
| 44642.645833333336 | 12.859 |
| 44642.65625 | 12.928 |
| 44642.666666666664 | 12.989 |
| 44642.677083333336 | 13.066 |
| 44642.6875 | 13.111 |
| 44642.697916666664 | 13.149 |
| 44642.708333333336 | 13.397 |
| 44642.71875 | 13.796 |
| 44642.729166666664 | 14.091 |
| 44642.739583333336 | 14.358 |
| 44642.75 | 14.716 |
| 44642.760416666664 | 14.842 |
| 44642.770833333336 | 15.572 |
| 44642.78125 | 15.683 |
| 44642.791666666664 | 15.623 |
| 44642.802083333336 | 15.801 |
| 44642.8125 | 15.775 |
| 44642.822916666664 | 16.118 |
| 44642.833333333336 | 16.496 |
| 44642.84375 | 16.655 |
| 44642.854166666664 | 16.954 |
| 44642.864583333336 | 17.122 |
| 44642.875 | 16.965 |
| 44642.885416666664 | 16.885 |
| 44642.895833333336 | 16.655 |
| 44642.90625 | 16.699 |
| 44642.916666666664 | 16.755 |
| 44642.927083333336 | 16.679 |
| 44642.9375 | 16.661 |
| 44642.947916666664 | 16.546 |
| 44642.958333333336 | 16.45 |
| 44642.96875 | 16.44 |
| 44642.979166666664 | 16.339 |
| 44642.989583333336 | 16.229 |
| 44643.0 | 16.105 |
| 44643.010416666664 | 15.919 |
| 44643.020833333336 | 15.679 |
| 44643.03125 | 15.351 |
| 44643.041666666664 | 15.1 |
| 44643.052083333336 | 14.91 |
| 44643.0625 | 14.797 |
| 44643.072916666664 | 14.586 |
| 44643.083333333336 | 14.418 |
| 44643.09375 | 14.299 |
| 44643.104166666664 | 14.212 |
| 44643.114583333336 | 14.148 |
| 44643.125 | 14.103 |
| 44643.135416666664 | 14.033 |
| 44643.145833333336 | 13.961 |
| 44643.15625 | 13.893 |
| 44643.166666666664 | 13.859 |
| 44643.177083333336 | 13.833 |
| 44643.1875 | 13.825 |
| 44643.197916666664 | 13.84 |
| 44643.208333333336 | 13.862 |
| 44643.21875 | 13.881 |
| 44643.229166666664 | 13.875 |
| 44643.239583333336 | 13.799 |
| 44643.25 | 13.713 |
| 44643.260416666664 | 13.642 |
| 44643.270833333336 | 13.588 |
| 44643.28125 | 13.47 |
| 44643.291666666664 | 13.434 |
| 44643.302083333336 | 13.442 |
| 44643.3125 | 13.317 |
| 44643.322916666664 | 13.228 |
| 44643.333333333336 | 13.178 |
| 44643.34375 | 13.228 |
| 44643.354166666664 | 13.345 |
| 44643.364583333336 | 13.483 |
| 44643.375 | 13.599 |
| 44643.385416666664 | 13.651 |
| 44643.395833333336 | 13.669 |
| 44643.40625 | 13.755 |
| 44643.416666666664 | 13.889 |
| 44643.427083333336 | 13.975 |
| 44643.4375 | 13.918 |
| 44643.447916666664 | 13.964 |
| 44643.458333333336 | 13.941 |
| 44643.46875 | 13.994 |
| 44643.479166666664 | 13.948 |
| 44643.489583333336 | 13.934 |
| 44643.5 | 13.875 |
| 44643.510416666664 | 14.006 |
| 44643.520833333336 | 13.998 |
| 44643.53125 | 13.982 |
| 44643.541666666664 | 13.908 |
| 44643.552083333336 | 13.716 |
| 44643.5625 | 13.517 |
| 44643.572916666664 | 13.492 |
| 44643.583333333336 | 13.489 |
| 44643.59375 | 13.465 |
| 44643.604166666664 | 13.477 |
| 44643.614583333336 | 13.459 |
| 44643.625 | 13.422 |
| 44643.635416666664 | 13.417 |
| 44643.645833333336 | 13.428 |
| 44643.65625 | 13.445 |
| 44643.666666666664 | 13.474 |
| 44643.677083333336 | 13.501 |
| 44643.6875 | 13.516 |
| 44643.697916666664 | 13.541 |
| 44643.708333333336 | 13.568 |
| 44643.71875 | 13.572 |
| 44643.729166666664 | 13.57 |
| 44643.739583333336 | 13.549 |
| 44643.75 | 13.611 |
| 44643.760416666664 | 13.73 |
| 44643.770833333336 | 13.726 |
| 44643.78125 | 13.747 |
| 44643.791666666664 | 13.793 |
| 44643.802083333336 | 13.772 |
| 44643.8125 | 13.844 |
| 44643.822916666664 | 13.872 |
| 44643.833333333336 | 13.954 |
| 44643.84375 | 14.109 |
| 44643.854166666664 | 14.17 |
| 44643.864583333336 | 14.287 |
| 44643.875 | 14.366 |
| 44643.885416666664 | 14.428 |
| 44643.895833333336 | 14.416 |
| 44643.90625 | 14.411 |
| 44643.916666666664 | 14.371 |
| 44643.927083333336 | 14.373 |
| 44643.9375 | 14.38 |
| 44643.947916666664 | 14.376 |
| 44643.958333333336 | 14.376 |
| 44643.96875 | 14.369 |
| 44643.979166666664 | 14.361 |
| 44643.989583333336 | 14.341 |
| 44644.0 | 14.321 |
| 44644.010416666664 | 14.301 |
| 44644.020833333336 | 14.266 |
| 44644.03125 | 14.226 |
| 44644.041666666664 | 14.105 |
| 44644.052083333336 | 14.02 |
| 44644.0625 | 13.983 |
| 44644.072916666664 | 13.958 |
| 44644.083333333336 | 13.94 |
| 44644.09375 | 13.923 |
| 44644.104166666664 | 13.896 |
| 44644.114583333336 | 13.9 |
| 44644.125 | 13.887 |
| 44644.135416666664 | 13.878 |
| 44644.145833333336 | 13.875 |
| 44644.15625 | 13.861 |
| 44644.166666666664 | 13.85 |
| 44644.177083333336 | 13.82 |
| 44644.1875 | 13.769 |
| 44644.197916666664 | 13.74 |
| 44644.208333333336 | 13.756 |
| 44644.21875 | 13.774 |
| 44644.229166666664 | 13.788 |
| 44644.239583333336 | 13.791 |
| 44644.25 | 13.793 |
| 44644.260416666664 | 13.798 |
| 44644.270833333336 | 13.809 |
| 44644.28125 | 13.829 |
| 44644.291666666664 | 13.821 |
| 44644.302083333336 | 13.828 |
| 44644.3125 | 13.856 |
| 44644.322916666664 | 13.877 |
| 44644.333333333336 | 13.92 |
| 44644.34375 | 13.936 |
| 44644.354166666664 | 13.951 |
| 44644.364583333336 | 13.974 |
| 44644.375 | 13.971 |
| 44644.385416666664 | 13.998 |
| 44644.395833333336 | 14.014 |
| 44644.40625 | 14.085 |
| 44644.416666666664 | 14.112 |
| 44644.427083333336 | 14.134 |
| 44644.4375 | 14.145 |
| 44644.447916666664 | 14.173 |
| 44644.458333333336 | 14.208 |
| 44644.46875 | 14.253 |
| 44644.479166666664 | 14.321 |
| 44644.489583333336 | 14.393 |
| 44644.5 | 14.433 |
| 44644.510416666664 | 14.5 |
| 44644.520833333336 | 14.478 |
| 44644.53125 | 14.587 |
| 44644.541666666664 | 14.741 |
| 44644.552083333336 | 14.601 |
| 44644.5625 | 14.815 |
| 44644.572916666664 | 14.599 |
| 44644.583333333336 | 14.624 |
| 44644.59375 | 14.593 |
| 44644.604166666664 | 14.569 |
| 44644.614583333336 | 14.613 |
| 44644.625 | 14.517 |
| 44644.635416666664 | 14.567 |
| 44644.645833333336 | 14.588 |
| 44644.65625 | 14.528 |
| 44644.666666666664 | 14.524 |
| 44644.677083333336 | 14.602 |
| 44644.6875 | 14.632 |
| 44644.697916666664 | 14.63 |
| 44644.708333333336 | 14.628 |
| 44644.71875 | 14.617 |
| 44644.729166666664 | 14.749 |
| 44644.739583333336 | 14.648 |
| 44644.75 | 14.686 |
| 44644.760416666664 | 15.005 |
| 44644.770833333336 | 15.192 |
| 44644.78125 | 15.382 |
| 44644.791666666664 | 15.354 |
| 44644.802083333336 | 15.146 |
| 44644.8125 | 15.254 |
| 44644.822916666664 | 15.153 |
| 44644.833333333336 | 15.514 |
| 44644.84375 | 15.708 |
| 44644.854166666664 | 15.432 |
| 44644.864583333336 | 15.789 |
| 44644.875 | 15.972 |
| 44644.885416666664 | 16.057 |
| 44644.895833333336 | 16.081 |
| 44644.90625 | 16.092 |
| 44644.916666666664 | 16.075 |
| 44644.927083333336 | 16.089 |
| 44644.9375 | 16.078 |
| 44644.947916666664 | 16.076 |
| 44644.958333333336 | 16.04 |
| 44644.96875 | 16.028 |
| 44644.979166666664 | 16.021 |
| 44644.989583333336 | 15.981 |
| 44645.0 | 15.962 |
| 44645.010416666664 | 15.943 |
| 44645.020833333336 | 15.95 |
| 44645.03125 | 15.939 |
| 44645.041666666664 | 15.926 |
| 44645.052083333336 | 15.873 |
| 44645.0625 | 15.789 |
| 44645.072916666664 | 15.687 |
| 44645.083333333336 | 15.563 |
| 44645.09375 | 15.287 |
| 44645.104166666664 | 15.149 |
| 44645.114583333336 | 15.096 |
| 44645.125 | 15.043 |
| 44645.135416666664 | 14.999 |
| 44645.145833333336 | 14.918 |
| 44645.15625 | 14.865 |
| 44645.166666666664 | 14.808 |
| 44645.177083333336 | 14.827 |
| 44645.1875 | 14.837 |
| 44645.197916666664 | 14.823 |
| 44645.208333333336 | 14.809 |
| 44645.21875 | 14.806 |
| 44645.229166666664 | 14.777 |
| 44645.239583333336 | 14.724 |
| 44645.25 | 14.629 |
| 44645.260416666664 | 14.515 |
| 44645.270833333336 | 14.444 |
| 44645.28125 | 14.416 |
| 44645.291666666664 | 14.353 |
| 44645.302083333336 | 14.392 |
| 44645.3125 | 14.385 |
| 44645.322916666664 | 14.542 |
| 44645.333333333336 | 14.46 |
| 44645.34375 | 14.527 |
| 44645.354166666664 | 14.637 |
| 44645.364583333336 | 14.679 |
| 44645.375 | 14.67 |
| 44645.385416666664 | 14.718 |
| 44645.395833333336 | 14.672 |
| 44645.40625 | 14.673 |
| 44645.416666666664 | 14.704 |
| 44645.427083333336 | 14.707 |
| 44645.4375 | 14.768 |
| 44645.447916666664 | 14.787 |
| 44645.458333333336 | 14.799 |
| 44645.46875 | 14.835 |
| 44645.479166666664 | 14.836 |
| 44645.489583333336 | 14.795 |
| 44645.5 | 14.762 |
| 44645.510416666664 | 14.804 |
| 44645.520833333336 | 14.798 |
| 44645.53125 | 14.783 |
| 44645.541666666664 | 14.785 |
| 44645.552083333336 | 14.773 |
| 44645.5625 | 14.805 |
| 44645.572916666664 | 14.812 |
| 44645.583333333336 | 14.802 |
| 44645.59375 | 14.822 |
| 44645.604166666664 | 14.814 |
| 44645.614583333336 | 14.789 |
| 44645.625 | 14.777 |
| 44645.635416666664 | 14.745 |
| 44645.645833333336 | 14.765 |
| 44645.65625 | 14.712 |
| 44645.666666666664 | 14.657 |
| 44645.677083333336 | 14.66 |
| 44645.6875 | 14.328 |
| 44645.697916666664 | 14.325 |
| 44645.708333333336 | 14.209 |
| 44645.71875 | 14.123 |
| 44645.729166666664 | 14.179 |
| 44645.739583333336 | 14.134 |
| 44645.75 | 14.14 |
| 44645.760416666664 | 14.12 |
| 44645.770833333336 | 14.188 |
| 44645.78125 | 14.173 |
| 44645.791666666664 | 14.41 |
| 44645.802083333336 | 14.56 |
| 44645.8125 | 14.759 |
| 44645.822916666664 | 14.901 |
| 44645.833333333336 | 14.974 |
| 44645.84375 | 15.02 |
| 44645.854166666664 | 15.041 |
| 44645.864583333336 | 15.631 |
| 44645.875 | 15.777 |
| 44645.885416666664 | 16.401 |
| 44645.895833333336 | 16.295 |
| 44645.90625 | 15.716 |
| 44645.916666666664 | 15.284 |
| 44645.927083333336 | 16.318 |
| 44645.9375 | 16.431 |
| 44645.947916666664 | 16.351 |
| 44645.958333333336 | 16.244 |
| 44645.96875 | 16.159 |
| 44645.979166666664 | 16.065 |
| 44645.989583333336 | 15.96 |
| 44646.0 | 15.886 |
| 44646.010416666664 | 15.783 |
| 44646.020833333336 | 15.67 |
| 44646.03125 | 15.51 |
| 44646.041666666664 | 15.459 |
| 44646.052083333336 | 15.401 |
| 44646.0625 | 15.393 |
| 44646.072916666664 | 15.395 |
| 44646.083333333336 | 15.423 |
| 44646.09375 | 15.435 |
| 44646.104166666664 | 15.419 |
| 44646.114583333336 | 15.443 |
| 44646.125 | 15.425 |
| 44646.135416666664 | 15.281 |
| 44646.145833333336 | 15.08 |
| 44646.15625 | 14.964 |
| 44646.166666666664 | 14.911 |
| 44646.177083333336 | 14.809 |
| 44646.1875 | 14.63 |
| 44646.197916666664 | 14.461 |
| 44646.208333333336 | 14.223 |
| 44646.21875 | 14.123 |
| 44646.229166666664 | 14.073 |
| 44646.239583333336 | 14.006 |
| 44646.25 | 13.967 |
| 44646.260416666664 | 13.912 |
| 44646.270833333336 | 13.865 |
| 44646.28125 | 13.843 |
| 44646.291666666664 | 13.835 |
| 44646.302083333336 | 13.82 |
| 44646.3125 | 13.812 |
| 44646.322916666664 | 13.805 |
| 44646.333333333336 | 13.786 |
| 44646.34375 | 13.765 |
| 44646.354166666664 | 13.803 |
| 44646.364583333336 | 13.81 |
| 44646.375 | 13.798 |
| 44646.385416666664 | 13.756 |
| 44646.395833333336 | 13.721 |
| 44646.40625 | 13.634 |
| 44646.416666666664 | 13.487 |
| 44646.427083333336 | 13.291 |
| 44646.4375 | 13.033 |
| 44646.447916666664 | 12.993 |
| 44646.458333333336 | 12.939 |
| 44646.46875 | 13.014 |
| 44646.479166666664 | 12.96 |
| 44646.489583333336 | 12.946 |
| 44646.5 | 12.982 |
| 44646.510416666664 | 13.1 |
| 44646.520833333336 | 13.208 |
| 44646.53125 | 13.382 |
| 44646.541666666664 | 13.467 |
| 44646.552083333336 | 13.575 |
| 44646.5625 | 13.629 |
| 44646.572916666664 | 13.626 |
| 44646.583333333336 | 13.671 |
| 44646.59375 | 13.667 |
| 44646.604166666664 | 13.665 |
| 44646.614583333336 | 13.686 |
| 44646.625 | 13.81 |
| 44646.635416666664 | 13.71 |
| 44646.645833333336 | 13.676 |
| 44646.65625 | 13.68 |
| 44646.666666666664 | 13.746 |
| 44646.677083333336 | 13.74 |
| 44646.6875 | 13.677 |
| 44646.697916666664 | 13.745 |
| 44646.708333333336 | 13.815 |
| 44646.71875 | 14.035 |
| 44646.729166666664 | 14.164 |
| 44646.739583333336 | 14.254 |
| 44646.75 | 14.148 |
| 44646.760416666664 | 14.115 |
| 44646.770833333336 | 14.162 |
| 44646.78125 | 14.169 |
| 44646.791666666664 | 14.166 |
| 44646.802083333336 | 14.137 |
| 44646.8125 | 14.098 |
| 44646.822916666664 | 14.08 |
| 44646.833333333336 | 14.061 |
| 44646.84375 | 14.062 |
| 44646.854166666664 | 14.035 |
| 44646.864583333336 | 14.055 |
| 44646.875 | 14.037 |
| 44646.885416666664 | 14.123 |
| 44646.895833333336 | 14.363 |
| 44646.90625 | 14.584 |
| 44646.916666666664 | 14.447 |
| 44646.927083333336 | 14.503 |
| 44646.9375 | 14.63 |
| 44646.947916666664 | 14.531 |
| 44646.958333333336 | 14.496 |
| 44646.96875 | 14.418 |
| 44646.979166666664 | 14.317 |
| 44646.989583333336 | 14.266 |
| 44647.0 | 14.122 |
| 44647.010416666664 | 14.099 |
| 44647.020833333336 | 14.102 |
| 44647.03125 | 14.09 |
| 44647.041666666664 | 14.031 |
| 44647.052083333336 | 14.003 |
| 44647.0625 | 13.893 |
| 44647.072916666664 | 13.814 |
| 44647.083333333336 | 13.735 |
| 44647.09375 | 13.743 |
| 44647.104166666664 | 13.689 |
| 44647.114583333336 | 13.604 |
| 44647.125 | 13.732 |
| 44647.135416666664 | 13.746 |
| 44647.145833333336 | 13.648 |
| 44647.15625 | 13.772 |
| 44647.166666666664 | 13.711 |
| 44647.177083333336 | 13.643 |
| 44647.1875 | 13.391 |
| 44647.197916666664 | 13.233 |
| 44647.208333333336 | 13.063 |
| 44647.21875 | 12.859 |
| 44647.229166666664 | 12.586 |
| 44647.239583333336 | 12.55 |
| 44647.25 | 12.374 |
| 44647.260416666664 | 12.229 |
| 44647.270833333336 | 12.104 |
| 44647.28125 | 12.004 |
| 44647.291666666664 | 11.901 |
| 44647.302083333336 | 11.778 |
| 44647.3125 | 11.655 |
| 44647.322916666664 | 11.535 |
| 44647.333333333336 | 11.466 |
| 44647.34375 | 11.431 |
| 44647.354166666664 | 11.435 |
| 44647.364583333336 | 11.412 |
| 44647.375 | 11.391 |
| 44647.385416666664 | 11.374 |
| 44647.395833333336 | 11.345 |
| 44647.40625 | 11.375 |
| 44647.416666666664 | 11.395 |
| 44647.427083333336 | 11.393 |
| 44647.4375 | 11.273 |
| 44647.447916666664 | 11.267 |
| 44647.458333333336 | 11.014 |
| 44647.46875 | 10.886 |
| 44647.479166666664 | 10.545 |
| 44647.489583333336 | 10.592 |
| 44647.5 | 9.981 |
| 44647.510416666664 | 10.043 |
| 44647.520833333336 | 10.137 |
| 44647.53125 | 10.265 |
| 44647.541666666664 | 10.502 |
| 44647.552083333336 | 10.57 |
| 44647.5625 | 10.615 |
| 44647.572916666664 | 10.697 |
| 44647.583333333336 | 10.702 |
| 44647.59375 | 10.769 |
| 44647.604166666664 | 10.818 |
| 44647.614583333336 | 10.894 |
| 44647.625 | 10.898 |
| 44647.635416666664 | 10.984 |
| 44647.645833333336 | 11.005 |
| 44647.65625 | 11.108 |
| 44647.666666666664 | 11.168 |
| 44647.677083333336 | 11.336 |
| 44647.6875 | 11.212 |
| 44647.697916666664 | 11.098 |
| 44647.708333333336 | 11.058 |
| 44647.71875 | 11.108 |
| 44647.729166666664 | 11.178 |
| 44647.739583333336 | 11.262 |
| 44647.75 | 11.353 |
| 44647.760416666664 | 11.432 |
| 44647.770833333336 | 11.534 |
| 44647.78125 | 11.617 |
| 44647.791666666664 | 11.67 |
| 44647.802083333336 | 11.718 |
| 44647.8125 | 11.745 |
| 44647.822916666664 | 11.763 |
| 44647.833333333336 | 11.788 |
| 44647.84375 | 11.825 |
| 44647.854166666664 | 11.839 |
| 44647.864583333336 | 11.849 |
| 44647.875 | 11.855 |
| 44647.885416666664 | 11.844 |
| 44647.895833333336 | 11.819 |
| 44647.90625 | 11.792 |
| 44647.916666666664 | 11.758 |
| 44647.927083333336 | 11.775 |
| 44647.9375 | 11.748 |
| 44647.947916666664 | 11.754 |
| 44647.958333333336 | 11.693 |
| 44647.96875 | 11.746 |
| 44647.979166666664 | 11.723 |
| 44647.989583333336 | 11.588 |
| 44648.0 | 11.571 |
| 44648.010416666664 | 11.525 |
| 44648.020833333336 | 11.416 |
| 44648.03125 | 11.261 |
| 44648.041666666664 | 11.285 |
| 44648.052083333336 | 11.187 |
| 44648.0625 | 11.077 |
| 44648.072916666664 | 10.962 |
| 44648.083333333336 | 10.839 |
| 44648.09375 | 10.73 |
| 44648.104166666664 | 10.637 |
| 44648.114583333336 | 10.491 |
| 44648.125 | 10.354 |
| 44648.135416666664 | 10.282 |
| 44648.145833333336 | 10.195 |
| 44648.15625 | 10.138 |
| 44648.166666666664 | 10.107 |
| 44648.177083333336 | 10.057 |
| 44648.1875 | 9.92 |
| 44648.197916666664 | 10.025 |
| 44648.208333333336 | 10.103 |
| 44648.21875 | 10.144 |
| 44648.229166666664 | 9.944 |
| 44648.239583333336 | 9.799 |
| 44648.25 | 9.685 |
| 44648.260416666664 | 9.52 |
| 44648.270833333336 | 9.396 |
| 44648.28125 | 9.209 |
| 44648.291666666664 | 9.043 |
| 44648.302083333336 | 8.833 |
| 44648.3125 | 8.61 |
| 44648.322916666664 | 8.402 |
| 44648.333333333336 | 8.252 |
| 44648.34375 | 8.097 |
| 44648.354166666664 | 8.007 |
| 44648.364583333336 | 8.087 |
| 44648.375 | 8.393 |
| 44648.385416666664 | 8.637 |
| 44648.395833333336 | 8.742 |
| 44648.40625 | 8.784 |
| 44648.416666666664 | 8.789 |
| 44648.427083333336 | 8.794 |
| 44648.4375 | 8.809 |
| 44648.447916666664 | 8.817 |
| 44648.458333333336 | 8.823 |
| 44648.46875 | 8.846 |
| 44648.479166666664 | 8.871 |
| 44648.489583333336 | 8.835 |
| 44648.5 | 8.765 |
| 44648.510416666664 | 8.342 |
| 44648.520833333336 | 7.947 |
| 44648.53125 | 8.165 |
| 44648.541666666664 | 7.424 |
| 44648.552083333336 | 7.141 |
| 44648.5625 | 7.05 |
| 44648.572916666664 | 7.185 |
| 44648.583333333336 | 7.283 |
| 44648.59375 | 7.23 |
| 44648.604166666664 | 7.264 |
| 44648.614583333336 | 7.457 |
| 44648.625 | 7.552 |
| 44648.635416666664 | 7.753 |
| 44648.645833333336 | 7.84 |
| 44648.65625 | 7.982 |
| 44648.666666666664 | 8.143 |
| 44648.677083333336 | 8.292 |
| 44648.6875 | 8.343 |
| 44648.697916666664 | 8.395 |
| 44648.708333333336 | 8.574 |
| 44648.71875 | 8.537 |
| 44648.729166666664 | 8.369 |
| 44648.739583333336 | 8.282 |
| 44648.75 | 8.308 |
| 44648.760416666664 | 8.417 |
| 44648.770833333336 | 8.734 |
| 44648.78125 | 9.111 |
| 44648.791666666664 | 9.268 |
| 44648.802083333336 | 9.421 |
| 44648.8125 | 9.532 |
| 44648.822916666664 | 9.706 |
| 44648.833333333336 | 9.934 |
| 44648.84375 | 10.156 |
| 44648.854166666664 | 10.262 |
| 44648.864583333336 | 10.38 |
| 44648.875 | 10.515 |
| 44648.885416666664 | 10.601 |
| 44648.895833333336 | 10.643 |
| 44648.90625 | 10.766 |
| 44648.916666666664 | 10.787 |
| 44648.927083333336 | 10.748 |
| 44648.9375 | 10.697 |
| 44648.947916666664 | 10.596 |
| 44648.958333333336 | 10.577 |
| 44648.96875 | 10.553 |
| 44648.979166666664 | 10.454 |
| 44648.989583333336 | 10.35 |
| 44649.0 | 10.183 |
| 44649.010416666664 | 10.125 |
| 44649.020833333336 | 9.968 |
| 44649.03125 | 9.836 |
| 44649.041666666664 | 9.462 |
| 44649.052083333336 | 9.113 |
| 44649.0625 | 8.933 |
| 44649.072916666664 | 8.602 |
| 44649.083333333336 | 8.356 |
| 44649.09375 | 8.178 |
| 44649.104166666664 | 8.003 |
| 44649.114583333336 | 7.883 |
| 44649.125 | 7.769 |
| 44649.135416666664 | 7.705 |
| 44649.145833333336 | 7.66 |
| 44649.15625 | 7.71 |
| 44649.166666666664 | 7.682 |
| 44649.177083333336 | 7.616 |
| 44649.1875 | 7.526 |
| 44649.197916666664 | 7.477 |
| 44649.208333333336 | 7.408 |
| 44649.21875 | 7.483 |
| 44649.229166666664 | 7.505 |
| 44649.239583333336 | 7.514 |
| 44649.25 | 7.537 |
| 44649.260416666664 | 7.358 |
| 44649.270833333336 | 7.252 |
| 44649.28125 | 7.126 |
| 44649.291666666664 | 7.001 |
| 44649.302083333336 | 6.941 |
| 44649.3125 | 6.684 |
| 44649.322916666664 | 6.456 |
| 44649.333333333336 | 6.359 |
| 44649.34375 | 6.247 |
| 44649.354166666664 | 6.139 |
| 44649.364583333336 | 6.029 |
| 44649.375 | 5.961 |
| 44649.385416666664 | 5.946 |
| 44649.395833333336 | 6.053 |
| 44649.40625 | 6.311 |
| 44649.416666666664 | 6.596 |
| 44649.427083333336 | 6.731 |
| 44649.4375 | 6.826 |
| 44649.447916666664 | 6.851 |
| 44649.458333333336 | 6.859 |
| 44649.46875 | 6.851 |
| 44649.479166666664 | 6.842 |
| 44649.489583333336 | 6.836 |
| 44649.5 | 6.774 |
| 44649.510416666664 | 6.712 |
| 44649.520833333336 | 6.638 |
| 44649.53125 | 6.462 |
| 44649.541666666664 | 6.332 |
| 44649.552083333336 | 6.27 |
| 44649.5625 | 6.294 |
| 44649.572916666664 | 6.141 |
| 44649.583333333336 | 5.915 |
| 44649.59375 | 5.671 |
| 44649.604166666664 | 5.646 |
| 44649.614583333336 | 5.683 |
| 44649.625 | 5.626 |
| 44649.635416666664 | 5.78 |
| 44649.645833333336 | 5.96 |
| 44649.65625 | 6.079 |
| 44649.666666666664 | 6.118 |
| 44649.677083333336 | 6.292 |
| 44649.6875 | 6.337 |
| 44649.697916666664 | 6.472 |
| 44649.708333333336 | 6.592 |
| 44649.71875 | 6.611 |
| 44649.729166666664 | 6.692 |
| 44649.739583333336 | 6.797 |
| 44649.75 | 7.084 |
| 44649.760416666664 | 7.046 |
| 44649.770833333336 | 6.936 |
| 44649.78125 | 6.932 |
| 44649.791666666664 | 6.867 |
| 44649.802083333336 | 7.061 |
| 44649.8125 | 7.2 |
| 44649.822916666664 | 7.359 |
| 44649.833333333336 | 7.492 |
| 44649.84375 | 7.834 |
| 44649.854166666664 | 7.912 |
| 44649.864583333336 | 8.116 |
| 44649.875 | 8.324 |
| 44649.885416666664 | 8.515 |
| 44649.895833333336 | 8.675 |
| 44649.90625 | 8.763 |
| 44649.916666666664 | 8.775 |
| 44649.927083333336 | 8.732 |
| 44649.9375 | 8.69 |
| 44649.947916666664 | 8.571 |
| 44649.958333333336 | 8.452 |
| 44649.96875 | 8.383 |
| 44649.979166666664 | 8.331 |
| 44649.989583333336 | 8.299 |
| 44650.0 | 8.243 |
| 44650.010416666664 | 8.19 |
| 44650.020833333336 | 8.294 |
| 44650.03125 | 8.261 |
| 44650.041666666664 | 8.254 |
| 44650.052083333336 | 8.245 |
| 44650.0625 | 8.209 |
| 44650.072916666664 | 8.202 |
| 44650.083333333336 | 8.126 |
| 44650.09375 | 8.065 |
| 44650.104166666664 | 7.99 |
| 44650.114583333336 | 7.868 |
| 44650.125 | 7.809 |
| 44650.135416666664 | 7.699 |
| 44650.145833333336 | 7.558 |
| 44650.15625 | 7.487 |
| 44650.166666666664 | 7.454 |
| 44650.177083333336 | 7.404 |
| 44650.1875 | 7.373 |
| 44650.197916666664 | 7.341 |
| 44650.208333333336 | 7.316 |
| 44650.21875 | 7.297 |
| 44650.229166666664 | 7.297 |
| 44650.239583333336 | 7.293 |
| 44650.25 | 7.283 |
| 44650.260416666664 | 7.219 |
| 44650.270833333336 | 7.194 |
| 44650.28125 | 7.246 |
| 44650.291666666664 | 7.25 |
| 44650.302083333336 | 7.277 |
| 44650.3125 | 7.296 |
| 44650.322916666664 | 7.319 |
| 44650.333333333336 | 7.303 |
| 44650.34375 | 7.25 |
| 44650.354166666664 | 7.164 |
| 44650.364583333336 | 7.143 |
| 44650.375 | 7.136 |
| 44650.385416666664 | 7.109 |
| 44650.395833333336 | 7.092 |
| 44650.40625 | 7.088 |
| 44650.416666666664 | 7.109 |
| 44650.427083333336 | 7.147 |
| 44650.4375 | 7.152 |
| 44650.447916666664 | 7.15 |
| 44650.458333333336 | 7.153 |
| 44650.46875 | 7.156 |
| 44650.479166666664 | 7.153 |
| 44650.489583333336 | 7.166 |
| 44650.5 | 7.182 |
| 44650.510416666664 | 7.197 |
| 44650.520833333336 | 7.201 |
| 44650.53125 | 7.208 |
| 44650.541666666664 | 7.208 |
| 44650.552083333336 | 7.178 |
| 44650.5625 | 7.15 |
| 44650.572916666664 | 7.191 |
| 44650.583333333336 | 7.193 |
| 44650.59375 | 7.23 |
| 44650.604166666664 | 7.268 |
| 44650.614583333336 | 7.282 |
| 44650.625 | 7.336 |
| 44650.635416666664 | 7.315 |
| 44650.645833333336 | 7.244 |
| 44650.65625 | 7.305 |
| 44650.666666666664 | 7.353 |
| 44650.677083333336 | 7.419 |
| 44650.6875 | 7.53 |
| 44650.697916666664 | 7.689 |
| 44650.708333333336 | 7.783 |
| 44650.71875 | 7.961 |
| 44650.729166666664 | 8.108 |
| 44650.739583333336 | 8.168 |
| 44650.75 | 8.282 |
| 44650.760416666664 | 8.379 |
| 44650.770833333336 | 8.465 |
| 44650.78125 | 8.575 |
| 44650.791666666664 | 8.504 |
| 44650.802083333336 | 8.493 |
| 44650.8125 | 8.51 |
| 44650.822916666664 | 8.605 |
| 44650.833333333336 | 8.783 |
| 44650.84375 | 9.157 |
| 44650.854166666664 | 9.388 |
| 44650.864583333336 | 9.547 |
| 44650.875 | 9.661 |
| 44650.885416666664 | 9.731 |
| 44650.895833333336 | 9.803 |
| 44650.90625 | 9.896 |
| 44650.916666666664 | 9.921 |
| 44650.927083333336 | 9.788 |
| 44650.9375 | 9.635 |
| 44650.947916666664 | 9.481 |
| 44650.958333333336 | 9.316 |
| 44650.96875 | 9.181 |
| 44650.979166666664 | 9.096 |
| 44650.989583333336 | 9.043 |
| 44651.0 | 8.993 |
| 44651.010416666664 | 8.971 |
| 44651.020833333336 | 8.932 |
| 44651.03125 | 8.871 |
| 44651.041666666664 | 8.858 |
| 44651.052083333336 | 9.026 |
| 44651.0625 | 8.959 |
| 44651.072916666664 | 9.024 |
| 44651.083333333336 | 9.177 |
| 44651.09375 | 9.229 |
| 44651.104166666664 | 9.338 |
| 44651.114583333336 | 9.318 |
| 44651.125 | 9.372 |
| 44651.135416666664 | 9.639 |
| 44651.145833333336 | 9.675 |
| 44651.15625 | 9.674 |
| 44651.166666666664 | 9.707 |
| 44651.177083333336 | 9.681 |
| 44651.1875 | 9.662 |
| 44651.197916666664 | 9.629 |
| 44651.208333333336 | 9.586 |
| 44651.21875 | 9.538 |
| 44651.229166666664 | 9.49 |
| 44651.239583333336 | 9.484 |
| 44651.25 | 9.471 |
| 44651.260416666664 | 9.486 |
| 44651.270833333336 | 9.492 |
| 44651.28125 | 9.483 |
| 44651.291666666664 | 9.499 |
| 44651.302083333336 | 9.501 |
| 44651.3125 | 9.477 |
| 44651.322916666664 | 9.465 |
| 44651.333333333336 | 9.467 |
| 44651.34375 | 9.476 |
| 44651.354166666664 | 9.504 |
| 44651.364583333336 | 9.45 |
| 44651.375 | 9.452 |
| 44651.385416666664 | 9.465 |
| 44651.395833333336 | 9.469 |
| 44651.40625 | 9.488 |
| 44651.416666666664 | 9.48 |
| 44651.427083333336 | 9.516 |
| 44651.4375 | 9.517 |
| 44651.447916666664 | 9.528 |
| 44651.458333333336 | 9.516 |
| 44651.46875 | 9.379 |
| 44651.479166666664 | 9.253 |
| 44651.489583333336 | 9.204 |
| 44651.5 | 9.192 |
| 44651.510416666664 | 9.199 |
| 44651.520833333336 | 9.23 |
| 44651.53125 | 9.266 |
| 44651.541666666664 | 9.295 |
| 44651.552083333336 | 9.323 |
| 44651.5625 | 9.349 |
| 44651.572916666664 | 9.392 |
| 44651.583333333336 | 9.442 |
| 44651.59375 | 9.774 |
| 44651.604166666664 | 9.822 |
| 44651.614583333336 | 10.074 |
| 44651.625 | 10.299 |
| 44651.635416666664 | 10.341 |
| 44651.645833333336 | 10.619 |
| 44651.65625 | 10.851 |
| 44651.666666666664 | 10.952 |
| 44651.677083333336 | 10.973 |
| 44651.6875 | 10.936 |
| 44651.697916666664 | 10.972 |
| 44651.708333333336 | 11.032 |
| 44651.71875 | 11.11 |
| 44651.729166666664 | 11.237 |
| 44651.739583333336 | 11.387 |
| 44651.75 | 11.445 |
| 44651.760416666664 | 11.514 |
| 44651.770833333336 | 11.555 |
| 44651.78125 | 11.578 |
| 44651.791666666664 | 11.622 |
| 44651.802083333336 | 11.641 |
| 44651.8125 | 11.679 |
| 44651.822916666664 | 11.638 |
| 44651.833333333336 | 11.567 |
| 44651.84375 | 11.502 |
| 44651.854166666664 | 11.636 |
| 44651.864583333336 | 11.797 |
| 44651.875 | 11.864 |
| 44651.885416666664 | 12.091 |
| 44651.895833333336 | 12.228 |
| 44651.90625 | 12.318 |
| 44651.916666666664 | 12.348 |
| 44651.927083333336 | 12.41 |
| 44651.9375 | 12.346 |
| 44651.947916666664 | 12.346 |
| 44651.958333333336 | 12.314 |
| 44651.96875 | 12.271 |
| 44651.979166666664 | 12.182 |
| 44651.989583333336 | 12.107 |
| 44652.0 | 12.013 |
| 44652.010416666664 | 11.962 |
| 44652.020833333336 | 11.92 |
| 44652.03125 | 11.876 |
| 44652.041666666664 | 11.848 |
| 44652.052083333336 | 11.865 |
| 44652.0625 | 11.892 |
| 44652.072916666664 | 11.943 |
| 44652.083333333336 | 12.026 |
| 44652.09375 | 12.022 |
| 44652.104166666664 | 12.122 |
| 44652.114583333336 | 12.329 |
| 44652.125 | 12.356 |
| 44652.135416666664 | 12.471 |
| 44652.145833333336 | 12.45 |